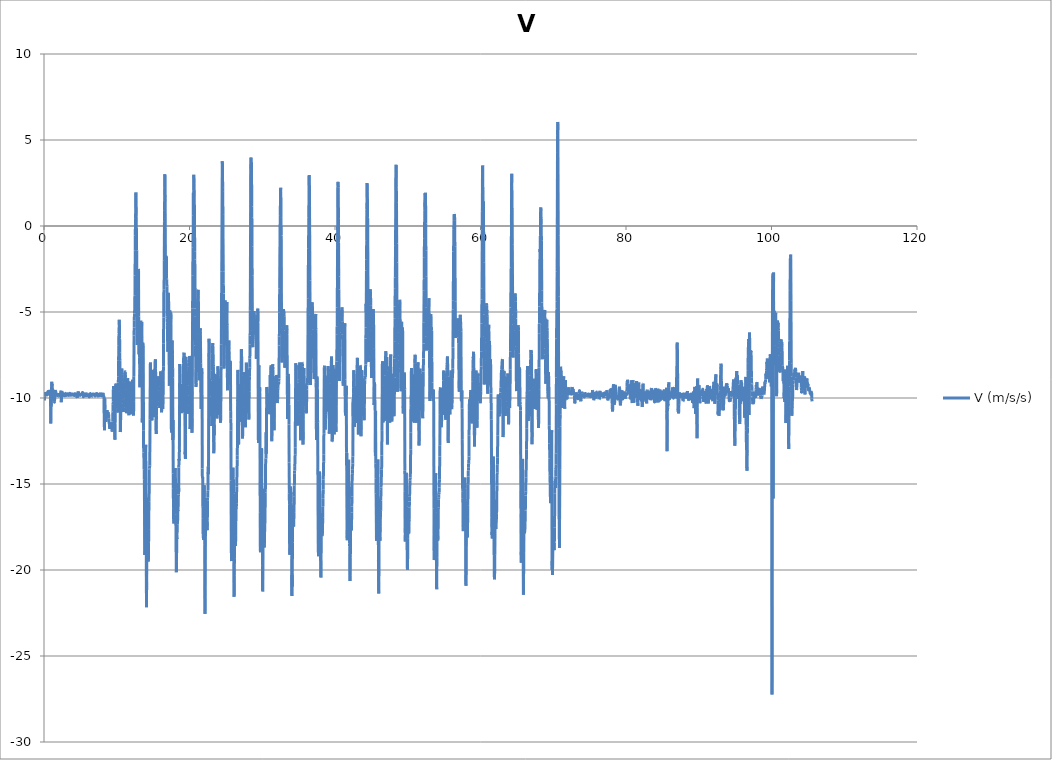
| Category | V (m/s/s) |
|---|---|
| 0.014828 | -9.987 |
| 0.033312 | -10.137 |
| 0.052657 | -9.997 |
| 0.073594 | -9.918 |
| 0.099538 | -9.695 |
| 0.11413 | -9.723 |
| 0.132724 | -9.752 |
| 0.152642 | -9.8 |
| 0.17395 | -9.753 |
| 0.195715 | -9.753 |
| 0.213507 | -9.658 |
| 0.232837 | -9.76 |
| 0.25277 | -9.891 |
| 0.273552 | -9.779 |
| 0.295497 | -9.808 |
| 0.313638 | -9.809 |
| 0.332784 | -9.827 |
| 0.352953 | -9.875 |
| 0.373611 | -9.846 |
| 0.395415 | -9.88 |
| 0.413828 | -9.761 |
| 0.435458 | -9.64 |
| 0.452765 | -9.806 |
| 0.473623 | -9.74 |
| 0.49787 | -9.73 |
| 0.513882 | -9.76 |
| 0.5327 | -9.676 |
| 0.552802 | -9.618 |
| 0.57368 | -9.631 |
| 0.595377 | -9.662 |
| 0.613696 | -9.668 |
| 0.633371 | -9.774 |
| 0.652706 | -9.787 |
| 0.673549 | -9.673 |
| 0.696035 | -9.623 |
| 0.713631 | -9.635 |
| 0.732768 | -9.588 |
| 0.752758 | -9.589 |
| 0.773644 | -9.578 |
| 0.797838 | -9.812 |
| 0.81363 | -9.841 |
| 0.832696 | -9.705 |
| 0.85277 | -9.528 |
| 0.873625 | -9.686 |
| 0.895427 | -9.631 |
| 0.913803 | -10.497 |
| 0.932687 | -11.481 |
| 0.952707 | -9.631 |
| 0.973551 | -10.498 |
| 1.011383 | -10.006 |
| 1.032716 | -9.709 |
| 1.052711 | -9.24 |
| 1.073556 | -9.057 |
| 1.095151 | -9.279 |
| 1.11373 | -9.18 |
| 1.133922 | -9.947 |
| 1.152786 | -9.455 |
| 1.173538 | -9.59 |
| 1.195185 | -9.78 |
| 1.213821 | -9.977 |
| 1.232802 | -10.112 |
| 1.252711 | -9.756 |
| 1.273586 | -9.534 |
| 1.295694 | -9.611 |
| 1.313564 | -9.87 |
| 1.332833 | -9.87 |
| 1.352706 | -9.822 |
| 1.373623 | -9.935 |
| 1.39573 | -10.194 |
| 1.413719 | -10.203 |
| 1.432829 | -10.244 |
| 1.452952 | -10.21 |
| 1.473679 | -9.945 |
| 1.49532 | -9.751 |
| 1.513655 | -9.945 |
| 1.532711 | -9.751 |
| 1.55285 | -9.528 |
| 1.573558 | -9.658 |
| 1.597969 | -9.603 |
| 1.613634 | -9.669 |
| 1.63548 | -9.716 |
| 1.652698 | -9.751 |
| 1.673706 | -9.87 |
| 1.697612 | -9.87 |
| 1.713776 | -9.861 |
| 1.73281 | -9.854 |
| 1.752711 | -9.835 |
| 1.77356 | -9.834 |
| 1.795916 | -9.843 |
| 1.813899 | -9.816 |
| 1.832722 | -9.788 |
| 1.852717 | -9.833 |
| 1.873562 | -9.797 |
| 1.895764 | -9.713 |
| 1.913624 | -9.779 |
| 1.932726 | -9.724 |
| 1.952706 | -9.797 |
| 1.97359 | -9.88 |
| 1.99529 | -9.863 |
| 2.013683 | -9.864 |
| 2.033416 | -9.836 |
| 2.052567 | -9.9 |
| 2.073694 | -9.861 |
| 2.095801 | -9.9 |
| 2.113812 | -9.788 |
| 2.132701 | -9.823 |
| 2.152845 | -9.713 |
| 2.173546 | -9.809 |
| 2.197192 | -9.862 |
| 2.213629 | -9.824 |
| 2.232739 | -9.823 |
| 2.252704 | -9.704 |
| 2.273159 | -9.815 |
| 2.295332 | -9.861 |
| 2.313627 | -9.722 |
| 2.332715 | -9.574 |
| 2.352763 | -9.964 |
| 2.373441 | -10.246 |
| 2.395185 | -10.106 |
| 2.413748 | -9.788 |
| 2.432953 | -9.621 |
| 2.452718 | -9.59 |
| 2.473509 | -9.73 |
| 2.495537 | -9.925 |
| 2.51386 | -9.905 |
| 2.532712 | -9.832 |
| 2.552706 | -9.763 |
| 2.573534 | -9.68 |
| 2.59359 | -9.82 |
| 2.613634 | -9.72 |
| 2.632714 | -9.728 |
| 2.652703 | -9.776 |
| 2.673203 | -9.805 |
| 2.695158 | -9.907 |
| 2.713899 | -9.811 |
| 2.732713 | -9.803 |
| 2.752948 | -9.795 |
| 2.773642 | -9.825 |
| 2.795154 | -9.788 |
| 2.813769 | -9.816 |
| 2.832967 | -9.863 |
| 2.852638 | -9.863 |
| 2.873005 | -9.787 |
| 2.897637 | -9.796 |
| 2.913171 | -9.769 |
| 2.933446 | -9.833 |
| 2.952735 | -9.919 |
| 2.973558 | -9.806 |
| 2.992884 | -9.751 |
| 3.013553 | -9.723 |
| 3.0327 | -9.722 |
| 3.0527 | -9.824 |
| 3.072582 | -9.824 |
| 3.095686 | -9.684 |
| 3.113913 | -9.704 |
| 3.132716 | -9.778 |
| 3.152701 | -9.852 |
| 3.173617 | -9.787 |
| 3.195031 | -9.89 |
| 3.213647 | -9.844 |
| 3.234661 | -9.843 |
| 3.252779 | -9.842 |
| 3.273546 | -9.824 |
| 3.295277 | -9.788 |
| 3.314479 | -9.816 |
| 3.332895 | -9.787 |
| 3.352673 | -9.862 |
| 3.37291 | -9.796 |
| 3.393348 | -9.89 |
| 3.413627 | -9.815 |
| 3.432721 | -9.909 |
| 3.452805 | -9.862 |
| 3.474368 | -9.778 |
| 3.495463 | -9.731 |
| 3.513681 | -9.75 |
| 3.532727 | -9.75 |
| 3.553249 | -9.733 |
| 3.573409 | -9.731 |
| 3.59519 | -9.741 |
| 3.613635 | -9.881 |
| 3.635107 | -9.815 |
| 3.652704 | -9.807 |
| 3.673611 | -9.807 |
| 3.695298 | -9.704 |
| 3.716745 | -9.788 |
| 3.732849 | -9.834 |
| 3.7527 | -9.824 |
| 3.773552 | -9.825 |
| 3.796027 | -9.751 |
| 3.813923 | -9.816 |
| 3.832712 | -9.787 |
| 3.852701 | -9.797 |
| 3.8782 | -9.695 |
| 3.895724 | -9.788 |
| 3.913722 | -9.797 |
| 3.932726 | -9.806 |
| 3.9569 | -9.796 |
| 3.973702 | -9.825 |
| 3.995506 | -9.825 |
| 4.013715 | -9.798 |
| 4.037663 | -9.863 |
| 4.053009 | -9.778 |
| 4.073746 | -9.797 |
| 4.09781 | -9.826 |
| 4.121558 | -9.825 |
| 4.134877 | -9.816 |
| 4.15274 | -9.844 |
| 4.173497 | -9.852 |
| 4.201035 | -9.852 |
| 4.213776 | -9.816 |
| 4.233285 | -9.751 |
| 4.252697 | -9.778 |
| 4.279486 | -9.853 |
| 4.293624 | -9.778 |
| 4.313627 | -9.778 |
| 4.33283 | -9.816 |
| 4.361215 | -9.798 |
| 4.373559 | -9.825 |
| 4.393698 | -9.796 |
| 4.413673 | -9.806 |
| 4.440919 | -9.769 |
| 4.452709 | -9.695 |
| 4.473555 | -9.741 |
| 4.49354 | -9.769 |
| 4.520549 | -9.89 |
| 4.533091 | -9.991 |
| 4.5527 | -10.001 |
| 4.573602 | -9.899 |
| 4.603688 | -9.817 |
| 4.613759 | -9.807 |
| 4.632674 | -9.872 |
| 4.652693 | -9.852 |
| 4.683061 | -9.676 |
| 4.693769 | -9.612 |
| 4.713624 | -9.639 |
| 4.732844 | -9.666 |
| 4.762378 | -9.769 |
| 4.773648 | -9.834 |
| 4.795921 | -9.852 |
| 4.813627 | -9.899 |
| 4.843679 | -9.826 |
| 4.852738 | -9.854 |
| 4.873551 | -9.834 |
| 4.893611 | -9.862 |
| 4.923822 | -9.844 |
| 4.933484 | -9.816 |
| 4.952835 | -9.844 |
| 4.973554 | -9.76 |
| 5.027864 | -9.833 |
| 5.032949 | -9.862 |
| 5.052697 | -9.834 |
| 5.076493 | -9.789 |
| 5.093517 | -9.797 |
| 5.113723 | -9.872 |
| 5.132705 | -9.806 |
| 5.15836 | -9.797 |
| 5.173628 | -9.76 |
| 5.193832 | -9.751 |
| 5.214466 | -9.816 |
| 5.23781 | -9.852 |
| 5.252823 | -9.796 |
| 5.273575 | -9.722 |
| 5.293647 | -9.677 |
| 5.319117 | -9.704 |
| 5.333466 | -9.779 |
| 5.352927 | -9.816 |
| 5.37359 | -9.881 |
| 5.400976 | -9.909 |
| 5.41408 | -9.927 |
| 5.432784 | -9.88 |
| 5.452998 | -9.844 |
| 5.478746 | -9.825 |
| 5.493581 | -9.806 |
| 5.513623 | -9.806 |
| 5.532674 | -9.732 |
| 5.558964 | -9.779 |
| 5.57367 | -9.835 |
| 5.593639 | -9.797 |
| 5.61371 | -9.759 |
| 5.641177 | -9.825 |
| 5.652593 | -9.825 |
| 5.673551 | -9.871 |
| 5.694494 | -9.853 |
| 5.721863 | -9.788 |
| 5.732665 | -9.806 |
| 5.752696 | -9.806 |
| 5.773683 | -9.825 |
| 5.803353 | -9.769 |
| 5.813825 | -9.76 |
| 5.832692 | -9.816 |
| 5.852747 | -9.861 |
| 5.883671 | -9.835 |
| 5.893716 | -9.854 |
| 5.913662 | -9.862 |
| 5.932676 | -9.843 |
| 5.963889 | -9.779 |
| 5.973363 | -9.779 |
| 5.996021 | -9.797 |
| 6.013616 | -9.778 |
| 6.044887 | -9.741 |
| 6.052998 | -9.797 |
| 6.073625 | -9.853 |
| 6.093624 | -9.797 |
| 6.143823 | -9.816 |
| 6.153442 | -9.863 |
| 6.173183 | -9.909 |
| 6.197106 | -9.881 |
| 6.213839 | -9.937 |
| 6.232706 | -9.909 |
| 6.25275 | -9.817 |
| 6.278285 | -9.826 |
| 6.295836 | -9.779 |
| 6.313626 | -9.759 |
| 6.332575 | -9.779 |
| 6.354832 | -9.761 |
| 6.373569 | -9.742 |
| 6.395368 | -9.797 |
| 6.413625 | -9.843 |
| 6.437737 | -9.862 |
| 6.452846 | -9.872 |
| 6.473558 | -9.863 |
| 6.495491 | -9.816 |
| 6.519151 | -9.844 |
| 6.532862 | -9.834 |
| 6.5527 | -9.77 |
| 6.573709 | -9.714 |
| 6.60019 | -9.806 |
| 6.613709 | -9.714 |
| 6.632788 | -9.806 |
| 6.652683 | -9.834 |
| 6.680739 | -9.89 |
| 6.693783 | -9.89 |
| 6.713632 | -9.789 |
| 6.733046 | -9.761 |
| 6.760252 | -9.825 |
| 6.77346 | -9.787 |
| 6.794191 | -9.797 |
| 6.813842 | -9.779 |
| 6.840516 | -9.779 |
| 6.852775 | -9.741 |
| 6.873694 | -9.825 |
| 6.894051 | -9.824 |
| 6.920926 | -9.789 |
| 6.932668 | -9.799 |
| 6.952857 | -9.817 |
| 6.973597 | -9.862 |
| 7.003451 | -9.881 |
| 7.013542 | -9.881 |
| 7.032782 | -9.834 |
| 7.052695 | -9.769 |
| 7.083575 | -9.779 |
| 7.093604 | -9.788 |
| 7.113866 | -9.788 |
| 7.132863 | -9.788 |
| 7.16236 | -9.872 |
| 7.174627 | -9.844 |
| 7.195258 | -9.835 |
| 7.2134 | -9.844 |
| 7.261721 | -9.741 |
| 7.273689 | -9.76 |
| 7.296472 | -9.805 |
| 7.317287 | -9.789 |
| 7.33276 | -9.771 |
| 7.352695 | -9.769 |
| 7.39537 | -9.881 |
| 7.417356 | -9.844 |
| 7.432724 | -9.834 |
| 7.452693 | -9.732 |
| 7.473618 | -9.779 |
| 7.49853 | -9.834 |
| 7.513598 | -9.806 |
| 7.532717 | -9.899 |
| 7.552686 | -9.834 |
| 7.578499 | -9.871 |
| 7.595318 | -9.835 |
| 7.613664 | -9.797 |
| 7.6328 | -9.806 |
| 7.656518 | -9.76 |
| 7.673396 | -9.798 |
| 7.695629 | -9.788 |
| 7.713612 | -9.732 |
| 7.73829 | -9.788 |
| 7.752794 | -9.797 |
| 7.773768 | -9.908 |
| 7.795281 | -9.826 |
| 7.820494 | -9.862 |
| 7.833662 | -9.826 |
| 7.852617 | -9.77 |
| 7.873718 | -9.769 |
| 7.902997 | -9.862 |
| 7.913767 | -9.852 |
| 7.932805 | -9.805 |
| 7.952667 | -9.806 |
| 7.980633 | -9.826 |
| 7.99385 | -9.826 |
| 8.013606 | -9.9 |
| 8.032676 | -9.834 |
| 8.05982 | -9.853 |
| 8.073597 | -9.816 |
| 8.093547 | -9.761 |
| 8.113616 | -9.696 |
| 8.141455 | -9.815 |
| 8.152774 | -9.824 |
| 8.173495 | -9.872 |
| 8.193635 | -9.946 |
| 8.222506 | -9.899 |
| 8.233431 | -9.909 |
| 8.252698 | -10.09 |
| 8.273545 | -11.442 |
| 8.318756 | -11.876 |
| 8.332595 | -10.663 |
| 8.352663 | -10.023 |
| 8.398863 | -11.111 |
| 8.413645 | -11.39 |
| 8.432683 | -11.157 |
| 8.455438 | -11.278 |
| 8.473762 | -11.166 |
| 8.495153 | -11.204 |
| 8.513687 | -11.314 |
| 8.536759 | -11.378 |
| 8.552891 | -10.961 |
| 8.573729 | -10.756 |
| 8.597349 | -10.811 |
| 8.619157 | -10.922 |
| 8.632839 | -10.96 |
| 8.652949 | -10.859 |
| 8.673544 | -10.7 |
| 8.699311 | -10.86 |
| 8.713729 | -11.093 |
| 8.73289 | -11.139 |
| 8.75271 | -11.089 |
| 8.778669 | -11.071 |
| 8.793901 | -10.886 |
| 8.813537 | -10.831 |
| 8.833106 | -10.821 |
| 8.857674 | -10.97 |
| 8.873639 | -11.028 |
| 8.893636 | -10.962 |
| 8.913713 | -11.173 |
| 8.93702 | -11.398 |
| 8.952752 | -11.472 |
| 8.97354 | -11.492 |
| 8.993517 | -11.408 |
| 9.01793 | -11.724 |
| 9.032851 | -11.733 |
| 9.052731 | -11.789 |
| 9.073555 | -11.665 |
| 9.100426 | -11.77 |
| 9.113888 | -11.697 |
| 9.132713 | -11.622 |
| 9.152702 | -11.779 |
| 9.180458 | -11.613 |
| 9.193732 | -11.566 |
| 9.213089 | -11.575 |
| 9.232697 | -11.481 |
| 9.260629 | -11.546 |
| 9.273715 | -11.583 |
| 9.293548 | -11.534 |
| 9.314246 | -11.508 |
| 9.339323 | -11.594 |
| 9.352772 | -11.882 |
| 9.372751 | -11.958 |
| 9.393624 | -11.881 |
| 9.435717 | -11.38 |
| 9.45278 | -10.868 |
| 9.473606 | -10.783 |
| 9.493265 | -10.369 |
| 9.513724 | -10.21 |
| 9.532824 | -9.523 |
| 9.552763 | -9.318 |
| 9.574627 | -9.405 |
| 9.594539 | -9.324 |
| 9.613646 | -9.517 |
| 9.633096 | -9.778 |
| 9.653078 | -10.179 |
| 9.673518 | -10.337 |
| 9.695676 | -11.027 |
| 9.713606 | -11.707 |
| 9.73472 | -12.312 |
| 9.752715 | -12.422 |
| 9.773619 | -11.573 |
| 9.795842 | -10.663 |
| 9.837608 | -9.33 |
| 9.853419 | -9.31 |
| 9.873781 | -9.23 |
| 9.896361 | -9.162 |
| 9.914085 | -9.385 |
| 9.932683 | -9.722 |
| 9.953022 | -9.627 |
| 9.975173 | -9.342 |
| 9.995654 | -9.284 |
| 10.013657 | -9.285 |
| 10.032859 | -9.373 |
| 10.054368 | -9.805 |
| 10.073628 | -10.103 |
| 10.096251 | -10.597 |
| 10.113635 | -10.616 |
| 10.134923 | -10.717 |
| 10.152769 | -10.808 |
| 10.173533 | -10.845 |
| 10.195907 | -9.864 |
| 10.218262 | -9.098 |
| 10.232726 | -8.745 |
| 10.252671 | -7.832 |
| 10.273527 | -6.95 |
| 10.298055 | -6.249 |
| 10.313885 | -6.221 |
| 10.332789 | -5.762 |
| 10.352758 | -5.453 |
| 10.379172 | -6.362 |
| 10.394326 | -6.547 |
| 10.413616 | -7.358 |
| 10.43269 | -7.81 |
| 10.458676 | -9.641 |
| 10.473619 | -10.653 |
| 10.493594 | -11.981 |
| 10.514413 | -11.801 |
| 10.555072 | -10.702 |
| 10.57377 | -10.62 |
| 10.593314 | -10.321 |
| 10.614391 | -9.735 |
| 10.632733 | -9.096 |
| 10.652692 | -8.622 |
| 10.673534 | -8.382 |
| 10.695392 | -8.288 |
| 10.713612 | -8.332 |
| 10.732838 | -8.5 |
| 10.752684 | -8.632 |
| 10.774995 | -9.057 |
| 10.795344 | -9.401 |
| 10.813541 | -9.764 |
| 10.832681 | -10.101 |
| 10.853299 | -10.315 |
| 10.872973 | -10.697 |
| 10.895849 | -10.818 |
| 10.914061 | -10.66 |
| 10.934105 | -10.791 |
| 10.952703 | -10.773 |
| 10.973539 | -10.557 |
| 10.995627 | -10.407 |
| 11.01641 | -10.025 |
| 11.032852 | -9.477 |
| 11.052686 | -9.113 |
| 11.073517 | -9.009 |
| 11.096878 | -8.666 |
| 11.113819 | -8.546 |
| 11.132699 | -8.502 |
| 11.152694 | -8.474 |
| 11.175125 | -8.49 |
| 11.195305 | -8.64 |
| 11.213898 | -8.798 |
| 11.232691 | -9.18 |
| 11.256385 | -9.506 |
| 11.273595 | -9.739 |
| 11.295469 | -10.122 |
| 11.313744 | -10.393 |
| 11.335207 | -10.643 |
| 11.352672 | -10.882 |
| 11.373135 | -10.731 |
| 11.395636 | -10.546 |
| 11.418736 | -9.867 |
| 11.433005 | -9.745 |
| 11.452721 | -9.236 |
| 11.473132 | -8.984 |
| 11.500461 | -8.854 |
| 11.514669 | -8.845 |
| 11.532682 | -9.006 |
| 11.552682 | -9.499 |
| 11.59823 | -10.597 |
| 11.613716 | -10.773 |
| 11.632756 | -10.634 |
| 11.652681 | -10.94 |
| 11.67418 | -11.002 |
| 11.695469 | -10.737 |
| 11.713599 | -10.469 |
| 11.734356 | -9.877 |
| 11.752706 | -9.309 |
| 11.773511 | -9.168 |
| 11.795101 | -9.05 |
| 11.816208 | -9.043 |
| 11.832705 | -9.192 |
| 11.852678 | -9.536 |
| 11.873544 | -9.731 |
| 11.896934 | -10.093 |
| 11.913704 | -10.138 |
| 11.932678 | -10.241 |
| 11.952674 | -10.093 |
| 11.97626 | -10.188 |
| 11.995336 | -10.523 |
| 12.013696 | -10.234 |
| 12.032896 | -10.95 |
| 12.055807 | -10.866 |
| 12.073243 | -10.818 |
| 12.095863 | -10.221 |
| 12.113654 | -9.933 |
| 12.135814 | -9.392 |
| 12.152677 | -9.224 |
| 12.173578 | -8.937 |
| 12.195492 | -9.091 |
| 12.219323 | -9.35 |
| 12.232952 | -9.711 |
| 12.252841 | -10.344 |
| 12.273494 | -10.486 |
| 12.29941 | -10.956 |
| 12.314494 | -11.021 |
| 12.333733 | -10.188 |
| 12.352672 | -8.741 |
| 12.380025 | -6.363 |
| 12.393924 | -5.899 |
| 12.413656 | -5.484 |
| 12.432694 | -5.081 |
| 12.473068 | -4.824 |
| 12.493551 | -4.029 |
| 12.514271 | -2.88 |
| 12.539683 | -1.413 |
| 12.552688 | -0.571 |
| 12.573527 | 0.452 |
| 12.593612 | 0.642 |
| 12.621493 | 1.854 |
| 12.63262 | 1.951 |
| 12.652686 | 1.643 |
| 12.673525 | 0.568 |
| 12.720545 | -0.755 |
| 12.732748 | -1.423 |
| 12.75268 | -2.784 |
| 12.775058 | -4.512 |
| 12.793824 | -6.071 |
| 12.813754 | -6.919 |
| 12.832695 | -6.305 |
| 12.857241 | -4.943 |
| 12.873567 | -4.39 |
| 12.89345 | -4.778 |
| 12.913601 | -5.125 |
| 12.936777 | -4.28 |
| 12.95279 | -3.53 |
| 12.973539 | -2.495 |
| 12.994139 | -2.604 |
| 13.01735 | -5.257 |
| 13.032798 | -6.338 |
| 13.052673 | -7.463 |
| 13.073803 | -5.784 |
| 13.098264 | -5.699 |
| 13.114645 | -6.658 |
| 13.132696 | -7.631 |
| 13.1533 | -8.291 |
| 13.178261 | -9.377 |
| 13.195669 | -9.19 |
| 13.213688 | -8.653 |
| 13.23289 | -8.743 |
| 13.258829 | -6.365 |
| 13.273594 | -5.676 |
| 13.296078 | -5.503 |
| 13.313777 | -5.812 |
| 13.338401 | -6.169 |
| 13.352765 | -6.392 |
| 13.373695 | -6.474 |
| 13.395609 | -6.166 |
| 13.42148 | -5.787 |
| 13.432757 | -5.576 |
| 13.452737 | -5.796 |
| 13.473586 | -7.804 |
| 13.50238 | -11.394 |
| 13.514927 | -11.419 |
| 13.532763 | -10.878 |
| 13.552907 | -9.748 |
| 13.584099 | -6.781 |
| 13.593617 | -6.873 |
| 13.613603 | -6.871 |
| 13.632797 | -7.036 |
| 13.663279 | -10.24 |
| 13.67375 | -11.87 |
| 13.69529 | -12.958 |
| 13.713603 | -13.168 |
| 13.765434 | -14.175 |
| 13.795748 | -14.731 |
| 13.841789 | -18.54 |
| 13.852719 | -19.134 |
| 13.873532 | -18.818 |
| 13.92138 | -15.401 |
| 13.932844 | -14.527 |
| 13.952672 | -13.302 |
| 13.97523 | -12.717 |
| 13.9936 | -13.097 |
| 14.012795 | -14.17 |
| 14.032924 | -16.147 |
| 14.057765 | -18.289 |
| 14.073549 | -21.346 |
| 14.093549 | -22.162 |
| 14.113744 | -20.701 |
| 14.158705 | -17.09 |
| 14.172775 | -16.641 |
| 14.194343 | -15.912 |
| 14.217451 | -15.845 |
| 14.232973 | -16.01 |
| 14.252711 | -15.791 |
| 14.272705 | -16.32 |
| 14.299948 | -17.925 |
| 14.313763 | -18.614 |
| 14.332665 | -19.504 |
| 14.352668 | -19.304 |
| 14.381411 | -18.387 |
| 14.393711 | -17.628 |
| 14.413668 | -16.624 |
| 14.432693 | -16.026 |
| 14.459612 | -15.346 |
| 14.473648 | -14.163 |
| 14.493973 | -14.089 |
| 14.5136 | -14.022 |
| 14.539397 | -13.92 |
| 14.552657 | -13.137 |
| 14.573528 | -11.268 |
| 14.593606 | -9.359 |
| 14.619052 | -8.04 |
| 14.632761 | -7.935 |
| 14.653017 | -8.584 |
| 14.673608 | -9.901 |
| 14.7022 | -11.019 |
| 14.713967 | -11.161 |
| 14.732757 | -11.125 |
| 14.752638 | -11.032 |
| 14.781401 | -11.129 |
| 14.794018 | -11.294 |
| 14.813599 | -11.129 |
| 14.832688 | -11.294 |
| 14.86159 | -11.071 |
| 14.873605 | -10.928 |
| 14.895977 | -10.125 |
| 14.913751 | -9.758 |
| 14.95883 | -8.413 |
| 14.973844 | -8.357 |
| 14.99357 | -8.387 |
| 15.016368 | -8.951 |
| 15.032626 | -9.117 |
| 15.052673 | -9.467 |
| 15.073537 | -10.056 |
| 15.098073 | -10.705 |
| 15.113845 | -10.996 |
| 15.132658 | -11.112 |
| 15.152703 | -10.591 |
| 15.176944 | -9.772 |
| 15.193789 | -9.217 |
| 15.213613 | -8.782 |
| 15.232683 | -8.417 |
| 15.258574 | -8.035 |
| 15.273632 | -7.867 |
| 15.293654 | -7.797 |
| 15.313666 | -7.753 |
| 15.338429 | -8.308 |
| 15.352682 | -8.766 |
| 15.373576 | -10.053 |
| 15.393658 | -11.293 |
| 15.418882 | -12.09 |
| 15.43282 | -11.826 |
| 15.452759 | -11.025 |
| 15.473407 | -10.497 |
| 15.500457 | -9.142 |
| 15.513618 | -9.015 |
| 15.532714 | -9.142 |
| 15.55283 | -9.015 |
| 15.582075 | -8.826 |
| 15.593785 | -8.74 |
| 15.613599 | -8.946 |
| 15.632802 | -8.9 |
| 15.661732 | -9.426 |
| 15.673633 | -9.546 |
| 15.693834 | -9.708 |
| 15.714407 | -9.872 |
| 15.740166 | -9.844 |
| 15.753549 | -9.824 |
| 15.773575 | -9.648 |
| 15.793566 | -9.758 |
| 15.820673 | -9.945 |
| 15.832844 | -9.953 |
| 15.852777 | -10.205 |
| 15.873495 | -10.472 |
| 15.902914 | -10.579 |
| 15.914614 | -10.392 |
| 15.93268 | -9.811 |
| 15.952704 | -9.316 |
| 15.999026 | -8.68 |
| 16.013569 | -8.483 |
| 16.032667 | -8.445 |
| 16.05563 | -8.457 |
| 16.073733 | -8.477 |
| 16.09592 | -9.636 |
| 16.113846 | -9.963 |
| 16.135181 | -10.551 |
| 16.152686 | -10.835 |
| 16.173488 | -10.756 |
| 16.195561 | -10.4 |
| 16.21764 | -9.731 |
| 16.232896 | -9.47 |
| 16.252672 | -8.947 |
| 16.293083 | -9.363 |
| 16.317909 | -10.639 |
| 16.333572 | -10.545 |
| 16.352719 | -10.019 |
| 16.373594 | -9.862 |
| 16.39911 | -9.001 |
| 16.413957 | -8.152 |
| 16.43274 | -6.848 |
| 16.452773 | -5.321 |
| 16.478701 | -3.841 |
| 16.49327 | -3.675 |
| 16.513269 | -3.133 |
| 16.532563 | -2.022 |
| 16.558431 | 0.248 |
| 16.57368 | 0.883 |
| 16.593597 | 2.232 |
| 16.613697 | 3.013 |
| 16.638711 | 2.202 |
| 16.652602 | 1.687 |
| 16.67359 | -0.081 |
| 16.69342 | -3.097 |
| 16.720833 | -3.018 |
| 16.733414 | -2.764 |
| 16.752716 | -2.029 |
| 16.773566 | -1.725 |
| 16.804083 | -2.177 |
| 16.813731 | -1.939 |
| 16.83268 | -1.793 |
| 16.852708 | -3.057 |
| 16.882097 | -3.13 |
| 16.893586 | -3.529 |
| 16.913599 | -5.265 |
| 16.932923 | -5.376 |
| 16.962811 | -5.594 |
| 16.972862 | -5.795 |
| 16.995661 | -6.788 |
| 17.013686 | -7.308 |
| 17.044228 | -7.096 |
| 17.052709 | -6.284 |
| 17.073553 | -4.941 |
| 17.093601 | -3.883 |
| 17.13883 | -4.492 |
| 17.155306 | -5.511 |
| 17.173897 | -6.093 |
| 17.197754 | -7.981 |
| 17.214446 | -8.67 |
| 17.232614 | -9.291 |
| 17.252931 | -9.197 |
| 17.277324 | -5.69 |
| 17.295755 | -4.906 |
| 17.313619 | -4.987 |
| 17.33284 | -5.734 |
| 17.355169 | -6.335 |
| 17.373589 | -6.268 |
| 17.397062 | -5.616 |
| 17.413977 | -5.24 |
| 17.437259 | -5.034 |
| 17.452705 | -5.65 |
| 17.474445 | -9.061 |
| 17.495544 | -11.572 |
| 17.519034 | -12.004 |
| 17.533738 | -11.494 |
| 17.552682 | -9.929 |
| 17.57377 | -7.851 |
| 17.60049 | -7.221 |
| 17.613526 | -6.714 |
| 17.632744 | -6.655 |
| 17.652799 | -7.484 |
| 17.681785 | -8.264 |
| 17.693107 | -8.805 |
| 17.713598 | -12.439 |
| 17.73282 | -11.282 |
| 17.761962 | -14.397 |
| 17.77341 | -15.24 |
| 17.794113 | -16.419 |
| 17.813611 | -17.067 |
| 17.840479 | -17.297 |
| 17.852608 | -17.241 |
| 17.873528 | -16.762 |
| 17.895738 | -15.546 |
| 17.922121 | -15.297 |
| 17.932771 | -15.483 |
| 17.952667 | -15.346 |
| 17.973563 | -15.099 |
| 18.004573 | -14.687 |
| 18.013702 | -14.317 |
| 18.032773 | -14.075 |
| 18.052728 | -14.479 |
| 18.084542 | -15.285 |
| 18.093556 | -15.988 |
| 18.113729 | -16.795 |
| 18.132682 | -17.642 |
| 18.165234 | -19.078 |
| 18.17349 | -19.632 |
| 18.195382 | -20.132 |
| 18.213777 | -19.509 |
| 18.259771 | -18.122 |
| 18.274112 | -18.2 |
| 18.295673 | -17.913 |
| 18.317239 | -17.37 |
| 18.333397 | -17.325 |
| 18.352824 | -17.083 |
| 18.373449 | -17.125 |
| 18.396237 | -16.518 |
| 18.413696 | -16.584 |
| 18.432893 | -16.392 |
| 18.452601 | -16.044 |
| 18.476294 | -15.616 |
| 18.495065 | -14.955 |
| 18.513619 | -15.456 |
| 18.532685 | -14.042 |
| 18.55659 | -13.546 |
| 18.573514 | -13.629 |
| 18.596278 | -13.586 |
| 18.613609 | -12.972 |
| 18.637286 | -9.425 |
| 18.652672 | -8.631 |
| 18.673449 | -8.021 |
| 18.698185 | -8.861 |
| 18.721836 | -9.778 |
| 18.733119 | -9.866 |
| 18.752741 | -10.299 |
| 18.77356 | -10.328 |
| 18.801077 | -10.393 |
| 18.81445 | -10.525 |
| 18.832594 | -10.789 |
| 18.852667 | -10.311 |
| 18.881936 | -10.73 |
| 18.894059 | -10.88 |
| 18.913738 | -10.771 |
| 18.932581 | -10.565 |
| 18.959219 | -10.221 |
| 18.973579 | -9.978 |
| 18.99374 | -9.19 |
| 19.013758 | -9.244 |
| 19.040991 | -9.827 |
| 19.052631 | -10.034 |
| 19.073512 | -10.542 |
| 19.092886 | -10.827 |
| 19.123118 | -10.182 |
| 19.132823 | -9.725 |
| 19.152667 | -8.865 |
| 19.173635 | -7.982 |
| 19.202384 | -7.51 |
| 19.213666 | -7.475 |
| 19.232675 | -7.393 |
| 19.253292 | -7.366 |
| 19.298084 | -7.548 |
| 19.313591 | -7.814 |
| 19.332699 | -8.491 |
| 19.35527 | -9.876 |
| 19.373229 | -11.633 |
| 19.394503 | -13.276 |
| 19.413796 | -13.126 |
| 19.435561 | -13.551 |
| 19.45267 | -12.142 |
| 19.473533 | -10.437 |
| 19.494125 | -7.668 |
| 19.51579 | -7.607 |
| 19.533598 | -7.903 |
| 19.552684 | -8.36 |
| 19.57353 | -8.531 |
| 19.597591 | -9.004 |
| 19.613751 | -9.766 |
| 19.632681 | -10.174 |
| 19.652701 | -10.382 |
| 19.678963 | -10.556 |
| 19.693485 | -10.559 |
| 19.713596 | -10.625 |
| 19.732671 | -10.738 |
| 19.758977 | -10.796 |
| 19.77277 | -10.915 |
| 19.793685 | -10.809 |
| 19.814752 | -10.436 |
| 19.838724 | -9.856 |
| 19.85261 | -9.268 |
| 19.87382 | -8.547 |
| 19.893559 | -8.164 |
| 19.921202 | -7.963 |
| 19.93289 | -7.924 |
| 19.953149 | -7.786 |
| 19.973767 | -7.897 |
| 20.002227 | -7.684 |
| 20.013738 | -7.563 |
| 20.032687 | -7.572 |
| 20.052695 | -7.863 |
| 20.080763 | -11.799 |
| 20.093643 | -11.57 |
| 20.113592 | -10.673 |
| 20.132764 | -10.255 |
| 20.161487 | -9.174 |
| 20.173597 | -8.662 |
| 20.19368 | -8.41 |
| 20.213685 | -8.342 |
| 20.241625 | -8.969 |
| 20.252608 | -10.156 |
| 20.273595 | -11.347 |
| 20.294166 | -9.633 |
| 20.323039 | -11.441 |
| 20.33285 | -11.897 |
| 20.352663 | -12.024 |
| 20.373579 | -11.138 |
| 20.423315 | -4.777 |
| 20.432811 | -4.189 |
| 20.452793 | -2.897 |
| 20.475831 | -1.272 |
| 20.493505 | -0.879 |
| 20.513645 | 0.602 |
| 20.532644 | 1.937 |
| 20.555675 | 1.121 |
| 20.573528 | 2.056 |
| 20.593634 | 2.978 |
| 20.613949 | 2.47 |
| 20.636449 | 2.082 |
| 20.652728 | 1.974 |
| 20.673589 | 1.108 |
| 20.693171 | 0.029 |
| 20.718726 | -1.473 |
| 20.732654 | -1.946 |
| 20.752748 | -2.79 |
| 20.773504 | -3.603 |
| 20.799579 | -4.797 |
| 20.813736 | -5.254 |
| 20.83264 | -6.969 |
| 20.852662 | -8.268 |
| 20.880316 | -9.306 |
| 20.893679 | -9.359 |
| 20.913595 | -9.221 |
| 20.932707 | -9.104 |
| 20.959911 | -7.783 |
| 20.973803 | -7.209 |
| 20.994201 | -6.387 |
| 21.013529 | -6.306 |
| 21.038602 | -6.197 |
| 21.05267 | -5.826 |
| 21.073548 | -5.309 |
| 21.095621 | -4.769 |
| 21.12146 | -4.382 |
| 21.132857 | -4.509 |
| 21.152664 | -4.19 |
| 21.173187 | -3.729 |
| 21.202096 | -3.708 |
| 21.21379 | -4.057 |
| 21.232654 | -5.061 |
| 21.252697 | -6.248 |
| 21.282298 | -7.174 |
| 21.293688 | -7.643 |
| 21.313048 | -8.476 |
| 21.332674 | -8.965 |
| 21.363912 | -8.733 |
| 21.37353 | -8.084 |
| 21.392826 | -7.028 |
| 21.413668 | -6.432 |
| 21.443072 | -5.973 |
| 21.452691 | -6.05 |
| 21.473518 | -5.945 |
| 21.493707 | -6.118 |
| 21.540451 | -7.977 |
| 21.552827 | -8.83 |
| 21.573613 | -10.381 |
| 21.599407 | -10.636 |
| 21.613932 | -10.311 |
| 21.633475 | -9.5 |
| 21.65284 | -8.95 |
| 21.677048 | -8.367 |
| 21.695961 | -8.269 |
| 21.713647 | -8.913 |
| 21.732598 | -9.817 |
| 21.755952 | -14.103 |
| 21.773528 | -14.664 |
| 21.794723 | -14.652 |
| 21.813692 | -14.601 |
| 21.838368 | -16.329 |
| 21.852535 | -16.994 |
| 21.87388 | -17.921 |
| 21.895267 | -18.009 |
| 21.91948 | -18.254 |
| 21.93264 | -18.145 |
| 21.952667 | -18.116 |
| 21.973482 | -17.617 |
| 22.000625 | -16.331 |
| 22.013004 | -15.581 |
| 22.032618 | -15.067 |
| 22.052587 | -16.212 |
| 22.080552 | -17.555 |
| 22.094854 | -18.525 |
| 22.113541 | -21.665 |
| 22.132602 | -22.551 |
| 22.185519 | -18.025 |
| 22.193777 | -17.181 |
| 22.213719 | -16.048 |
| 22.240403 | -15.913 |
| 22.252642 | -16.316 |
| 22.273522 | -16.958 |
| 22.293435 | -17.239 |
| 22.32182 | -16.97 |
| 22.33261 | -16.852 |
| 22.352656 | -17.001 |
| 22.373523 | -17.496 |
| 22.405656 | -17.24 |
| 22.413352 | -17.499 |
| 22.43268 | -17.685 |
| 22.452721 | -17.123 |
| 22.484109 | -15.943 |
| 22.493515 | -15.777 |
| 22.513517 | -15.518 |
| 22.532755 | -15.368 |
| 22.563965 | -14.168 |
| 22.57367 | -13.988 |
| 22.595027 | -14.427 |
| 22.613593 | -13.991 |
| 22.65888 | -7.636 |
| 22.674259 | -6.936 |
| 22.69436 | -6.554 |
| 22.716365 | -7.71 |
| 22.732844 | -8.899 |
| 22.752652 | -9.912 |
| 22.773288 | -10.561 |
| 22.799963 | -11.039 |
| 22.813669 | -11.064 |
| 22.83333 | -10.93 |
| 22.852664 | -10.963 |
| 22.879698 | -10.929 |
| 22.893716 | -10.808 |
| 22.913592 | -10.485 |
| 22.933163 | -10.115 |
| 22.958883 | -10.04 |
| 22.973786 | -10.147 |
| 22.993813 | -10.344 |
| 23.013589 | -10.693 |
| 23.040541 | -11.01 |
| 23.052606 | -11.337 |
| 23.073403 | -11.626 |
| 23.093657 | -11.06 |
| 23.120638 | -8.996 |
| 23.132905 | -8.391 |
| 23.152724 | -7.415 |
| 23.173428 | -6.938 |
| 23.202519 | -6.806 |
| 23.213949 | -6.994 |
| 23.232821 | -7.277 |
| 23.252643 | -7.532 |
| 23.283478 | -8.067 |
| 23.29358 | -8.185 |
| 23.313585 | -12.437 |
| 23.332655 | -13.21 |
| 23.362587 | -13.026 |
| 23.373507 | -11.55 |
| 23.395405 | -12.162 |
| 23.413383 | -11.4 |
| 23.443708 | -9.3 |
| 23.452661 | -8.839 |
| 23.473097 | -8.602 |
| 23.493717 | -8.638 |
| 23.523046 | -8.775 |
| 23.532657 | -8.841 |
| 23.552827 | -8.991 |
| 23.573522 | -8.972 |
| 23.607307 | -8.76 |
| 23.632662 | -8.786 |
| 23.652709 | -9.157 |
| 23.70491 | -10.605 |
| 23.733233 | -10.827 |
| 23.757545 | -11.19 |
| 23.773919 | -11.177 |
| 23.796195 | -10.505 |
| 23.813714 | -10.225 |
| 23.835981 | -9.309 |
| 23.852645 | -9.029 |
| 23.873526 | -8.46 |
| 23.895978 | -8.155 |
| 23.918645 | -8.216 |
| 23.933457 | -8.322 |
| 23.952661 | -8.427 |
| 23.973553 | -8.818 |
| 24.000339 | -9.715 |
| 24.013603 | -10.098 |
| 24.032717 | -10.732 |
| 24.052652 | -10.985 |
| 24.080311 | -10.802 |
| 24.09357 | -10.557 |
| 24.113511 | -10.051 |
| 24.132664 | -9.655 |
| 24.159949 | -9.364 |
| 24.173995 | -9.437 |
| 24.193635 | -9.499 |
| 24.213597 | -9.84 |
| 24.240488 | -11.167 |
| 24.252821 | -11.398 |
| 24.272899 | -11.442 |
| 24.293464 | -10.953 |
| 24.320349 | -9.905 |
| 24.332602 | -8.959 |
| 24.352652 | -8.157 |
| 24.373516 | -6.899 |
| 24.402697 | -4.888 |
| 24.413655 | -4.134 |
| 24.432814 | -2.652 |
| 24.452653 | -0.818 |
| 24.483415 | 1.98 |
| 24.49368 | 2.868 |
| 24.513552 | 3.766 |
| 24.532629 | 3.367 |
| 24.562803 | 2.232 |
| 24.573695 | 1.996 |
| 24.595217 | 0.68 |
| 24.613639 | -0.757 |
| 24.64271 | -2.64 |
| 24.652669 | -3.363 |
| 24.673499 | -3.918 |
| 24.693986 | -4.953 |
| 24.723432 | -7.398 |
| 24.733647 | -7.805 |
| 24.752734 | -8.279 |
| 24.77376 | -7.757 |
| 24.819679 | -5.792 |
| 24.832681 | -5.393 |
| 24.852568 | -4.898 |
| 24.875413 | -4.519 |
| 24.893543 | -4.324 |
| 24.91358 | -4.382 |
| 24.933132 | -5.092 |
| 24.957597 | -5.918 |
| 24.973551 | -6.622 |
| 24.99372 | -6.917 |
| 25.013577 | -6.897 |
| 25.038699 | -6.515 |
| 25.05262 | -5.952 |
| 25.07367 | -5.431 |
| 25.093616 | -5.127 |
| 25.117906 | -4.838 |
| 25.132679 | -4.459 |
| 25.152699 | -4.413 |
| 25.173517 | -5.782 |
| 25.200391 | -8.52 |
| 25.213859 | -9.205 |
| 25.232752 | -9.556 |
| 25.252646 | -8.599 |
| 25.281026 | -7.192 |
| 25.294222 | -7.455 |
| 25.313714 | -7.324 |
| 25.332694 | -8.037 |
| 25.359794 | -7.582 |
| 25.373538 | -7.269 |
| 25.393686 | -6.902 |
| 25.413668 | -6.659 |
| 25.441611 | -7.03 |
| 25.452621 | -7.548 |
| 25.473576 | -8.537 |
| 25.493675 | -8.644 |
| 25.52092 | -8.649 |
| 25.532782 | -8.825 |
| 25.552655 | -8.959 |
| 25.573573 | -8.995 |
| 25.603742 | -7.872 |
| 25.613695 | -7.836 |
| 25.632573 | -8.183 |
| 25.652646 | -10.763 |
| 25.684016 | -11.175 |
| 25.693735 | -11.909 |
| 25.713507 | -14.8 |
| 25.732663 | -17.734 |
| 25.764528 | -19.435 |
| 25.773788 | -19.48 |
| 25.79358 | -19.046 |
| 25.813248 | -18.096 |
| 25.842193 | -17.026 |
| 25.852597 | -16.505 |
| 25.873151 | -15.668 |
| 25.893785 | -15.288 |
| 25.940745 | -15.551 |
| 25.952977 | -15.18 |
| 25.973914 | -14.048 |
| 25.999589 | -14.809 |
| 26.013946 | -15.324 |
| 26.032654 | -14.752 |
| 26.052815 | -15.574 |
| 26.076647 | -17.67 |
| 26.093619 | -18.878 |
| 26.113583 | -20.767 |
| 26.133015 | -21.554 |
| 26.157968 | -20.324 |
| 26.173578 | -19.351 |
| 26.193542 | -17.619 |
| 26.213992 | -16.326 |
| 26.237313 | -15.888 |
| 26.252931 | -15.973 |
| 26.273523 | -16.709 |
| 26.293705 | -17.477 |
| 26.318385 | -18.574 |
| 26.332654 | -18.599 |
| 26.352695 | -17.973 |
| 26.373516 | -17.194 |
| 26.400961 | -16.448 |
| 26.414 | -16.467 |
| 26.432669 | -16.457 |
| 26.452663 | -16.143 |
| 26.48042 | -15.409 |
| 26.494515 | -15.127 |
| 26.512678 | -14.588 |
| 26.532827 | -14.307 |
| 26.562823 | -13.559 |
| 26.573585 | -13.354 |
| 26.595196 | -12.15 |
| 26.613736 | -10.22 |
| 26.641646 | -8.564 |
| 26.652619 | -8.365 |
| 26.673523 | -8.541 |
| 26.695365 | -9.957 |
| 26.722425 | -12.206 |
| 26.732728 | -12.609 |
| 26.752656 | -12.705 |
| 26.773481 | -11.762 |
| 26.804205 | -10.67 |
| 26.813526 | -10.518 |
| 26.83265 | -10.232 |
| 26.852646 | -10.026 |
| 26.883784 | -9.485 |
| 26.893691 | -9.392 |
| 26.913581 | -9.294 |
| 26.932658 | -9.203 |
| 26.963609 | -9.595 |
| 26.973585 | -9.912 |
| 26.996021 | -10.951 |
| 27.013589 | -11.384 |
| 27.058654 | -10.689 |
| 27.073643 | -10.068 |
| 27.093773 | -7.962 |
| 27.115751 | -7.333 |
| 27.132831 | -7.149 |
| 27.152658 | -7.404 |
| 27.173489 | -7.696 |
| 27.198439 | -8.465 |
| 27.213829 | -8.705 |
| 27.232857 | -9.453 |
| 27.252651 | -10.668 |
| 27.279167 | -12.236 |
| 27.29355 | -12.356 |
| 27.313578 | -12.052 |
| 27.332643 | -11.096 |
| 27.357901 | -9.753 |
| 27.373446 | -9.562 |
| 27.39369 | -9.363 |
| 27.413582 | -9.346 |
| 27.43914 | -9.342 |
| 27.452671 | -9.23 |
| 27.473495 | -9.007 |
| 27.493563 | -8.8 |
| 27.518865 | -8.553 |
| 27.532809 | -8.497 |
| 27.552643 | -8.554 |
| 27.572614 | -8.771 |
| 27.602255 | -9.408 |
| 27.614575 | -9.644 |
| 27.632649 | -10.535 |
| 27.652643 | -11.125 |
| 27.682622 | -11.705 |
| 27.693674 | -11.345 |
| 27.713574 | -10.646 |
| 27.732848 | -10.487 |
| 27.76206 | -9.543 |
| 27.773597 | -9.08 |
| 27.79324 | -8.416 |
| 27.812618 | -7.944 |
| 27.84083 | -8 |
| 27.852679 | -8.216 |
| 27.873487 | -8.594 |
| 27.898203 | -10.554 |
| 27.924667 | -10.822 |
| 27.933588 | -10.859 |
| 27.952649 | -10.585 |
| 27.973521 | -9.985 |
| 28.004402 | -9.039 |
| 28.014208 | -8.817 |
| 28.032795 | -8.58 |
| 28.052748 | -8.798 |
| 28.100507 | -10.235 |
| 28.113743 | -10.514 |
| 28.13287 | -11.045 |
| 28.155577 | -11.252 |
| 28.173543 | -11.167 |
| 28.19512 | -10.033 |
| 28.213654 | -9.622 |
| 28.235792 | -8.737 |
| 28.252694 | -8.494 |
| 28.273552 | -8.234 |
| 28.295299 | -7.697 |
| 28.318427 | -6.901 |
| 28.332706 | -6.359 |
| 28.352764 | -4.924 |
| 28.373642 | -2.913 |
| 28.399214 | 0.925 |
| 28.413819 | 2.847 |
| 28.432652 | 3.484 |
| 28.45271 | 3.976 |
| 28.479153 | 3.072 |
| 28.493627 | 1.955 |
| 28.513584 | 3.691 |
| 28.532751 | 2.828 |
| 28.561482 | 1.136 |
| 28.573438 | 0.483 |
| 28.593447 | -1.202 |
| 28.613617 | -2.885 |
| 28.640243 | -5.285 |
| 28.65267 | -6.062 |
| 28.673604 | -7.02 |
| 28.693828 | -7.045 |
| 28.719979 | -6.696 |
| 28.733032 | -6.566 |
| 28.752646 | -6.237 |
| 28.793489 | -6.205 |
| 28.820688 | -5.825 |
| 28.832939 | -5.743 |
| 28.852584 | -5.277 |
| 28.873624 | -4.941 |
| 28.902919 | -5.364 |
| 28.91399 | -5.566 |
| 28.932656 | -5.967 |
| 28.952606 | -6.036 |
| 28.981869 | -6.232 |
| 28.993652 | -6.29 |
| 29.012681 | -5.948 |
| 29.032641 | -5.565 |
| 29.062784 | -5.416 |
| 29.073575 | -5.66 |
| 29.095568 | -5.993 |
| 29.113573 | -6.466 |
| 29.142106 | -6.73 |
| 29.152572 | -6.978 |
| 29.173521 | -7.181 |
| 29.193715 | -7.724 |
| 29.24023 | -5.821 |
| 29.252567 | -5.5 |
| 29.273509 | -5.184 |
| 29.298526 | -5.702 |
| 29.314364 | -6.614 |
| 29.332643 | -6.823 |
| 29.35279 | -6.046 |
| 29.380652 | -4.807 |
| 29.394355 | -4.802 |
| 29.41349 | -5.618 |
| 29.4326 | -8.657 |
| 29.455772 | -12.061 |
| 29.473353 | -12.613 |
| 29.495038 | -11.185 |
| 29.513583 | -9.203 |
| 29.538718 | -8.103 |
| 29.552676 | -8.537 |
| 29.573756 | -9.961 |
| 29.594682 | -10.964 |
| 29.618938 | -10.288 |
| 29.633106 | -9.714 |
| 29.65293 | -9.381 |
| 29.673501 | -9.706 |
| 29.70364 | -14.888 |
| 29.713829 | -16.653 |
| 29.732626 | -18.843 |
| 29.752625 | -18.971 |
| 29.782991 | -18.696 |
| 29.793529 | -18.541 |
| 29.813576 | -17.852 |
| 29.832653 | -16.988 |
| 29.863146 | -15.461 |
| 29.873565 | -14.632 |
| 29.89521 | -13.121 |
| 29.913624 | -12.915 |
| 29.941516 | -14.64 |
| 29.952807 | -15.348 |
| 29.973484 | -16.702 |
| 29.997971 | -17.247 |
| 30.025332 | -18.717 |
| 30.032736 | -19.736 |
| 30.052635 | -21.243 |
| 30.073511 | -21.197 |
| 30.105021 | -19.012 |
| 30.113791 | -18.073 |
| 30.132646 | -16.275 |
| 30.153102 | -15.276 |
| 30.185264 | -16.204 |
| 30.193607 | -16.875 |
| 30.213576 | -18.326 |
| 30.232702 | -16.317 |
| 30.265095 | -18.44 |
| 30.27348 | -18.689 |
| 30.29565 | -18.447 |
| 30.31366 | -17.967 |
| 30.361789 | -17.281 |
| 30.37381 | -17.032 |
| 30.394786 | -16.39 |
| 30.421927 | -15.485 |
| 30.432769 | -15.232 |
| 30.452557 | -14.017 |
| 30.473574 | -13.664 |
| 30.500581 | -13.514 |
| 30.514128 | -13.012 |
| 30.532913 | -11.995 |
| 30.552635 | -13.236 |
| 30.579217 | -12.499 |
| 30.594186 | -11.053 |
| 30.612855 | -9.882 |
| 30.632706 | -9.358 |
| 30.664255 | -9.464 |
| 30.673521 | -9.808 |
| 30.693335 | -10.148 |
| 30.713633 | -10.485 |
| 30.741056 | -10.63 |
| 30.752659 | -10.486 |
| 30.773461 | -10.552 |
| 30.793601 | -10.399 |
| 30.818972 | -9.995 |
| 30.833099 | -9.845 |
| 30.852786 | -9.735 |
| 30.873442 | -9.877 |
| 30.90307 | -9.908 |
| 30.914193 | -9.86 |
| 30.932755 | -9.782 |
| 30.952624 | -9.901 |
| 30.98466 | -10.706 |
| 30.994305 | -10.942 |
| 31.013634 | -10.865 |
| 31.032645 | -10.174 |
| 31.06384 | -8.747 |
| 31.095374 | -8.669 |
| 31.113575 | -8.791 |
| 31.142353 | -8.733 |
| 31.152782 | -8.703 |
| 31.173532 | -8.416 |
| 31.193614 | -8.097 |
| 31.221428 | -8.103 |
| 31.232687 | -8.26 |
| 31.25273 | -9.409 |
| 31.27305 | -10.048 |
| 31.304912 | -12.448 |
| 31.313732 | -12.511 |
| 31.332665 | -11.927 |
| 31.352908 | -10.841 |
| 31.402875 | -8.415 |
| 31.414124 | -8.22 |
| 31.432668 | -8.04 |
| 31.456225 | -8.152 |
| 31.473534 | -8.352 |
| 31.494347 | -8.742 |
| 31.513573 | -8.768 |
| 31.536898 | -8.732 |
| 31.552675 | -8.835 |
| 31.572943 | -9.362 |
| 31.595346 | -10.437 |
| 31.620608 | -11.499 |
| 31.632859 | -11.879 |
| 31.652635 | -11.286 |
| 31.67342 | -9.52 |
| 31.699453 | -9.215 |
| 31.714116 | -9.104 |
| 31.7327 | -8.919 |
| 31.753477 | -9.189 |
| 31.779776 | -9.728 |
| 31.793913 | -10.297 |
| 31.81355 | -10.219 |
| 31.832719 | -10.208 |
| 31.861151 | -10.279 |
| 31.873541 | -9.911 |
| 31.893521 | -9.441 |
| 31.914825 | -9.199 |
| 31.942135 | -8.827 |
| 31.952586 | -8.66 |
| 31.973298 | -8.672 |
| 31.993591 | -9.124 |
| 32.022643 | -9.85 |
| 32.032596 | -9.97 |
| 32.052559 | -10.173 |
| 32.07355 | -10.292 |
| 32.103844 | -10.208 |
| 32.113785 | -10.086 |
| 32.132672 | -9.759 |
| 32.15264 | -9.462 |
| 32.185512 | -9.236 |
| 32.213169 | -9.143 |
| 32.232653 | -9.181 |
| 32.262975 | -9.189 |
| 32.273666 | -9.045 |
| 32.295846 | -8.873 |
| 32.313905 | -7.852 |
| 32.343551 | -6.944 |
| 32.352663 | -6.411 |
| 32.373502 | -5.045 |
| 32.393701 | -3.623 |
| 32.42416 | -1.225 |
| 32.452733 | -0.053 |
| 32.473511 | 0.62 |
| 32.523812 | 2.147 |
| 32.532695 | 2.224 |
| 32.55259 | 1.996 |
| 32.590213 | 0.48 |
| 32.594183 | 0.006 |
| 32.615162 | -0.56 |
| 32.632627 | -3.894 |
| 32.665334 | -5.9 |
| 32.673013 | -6.433 |
| 32.695663 | -7.839 |
| 32.713505 | -7.934 |
| 32.736559 | -7.757 |
| 32.752662 | -7.516 |
| 32.773642 | -6.901 |
| 32.794964 | -6.236 |
| 32.820422 | -5.387 |
| 32.833816 | -5.209 |
| 32.85265 | -5.063 |
| 32.873047 | -5.099 |
| 32.901668 | -4.991 |
| 32.91353 | -4.884 |
| 32.932729 | -4.828 |
| 32.952691 | -5.053 |
| 32.980671 | -5.002 |
| 32.993628 | -5.033 |
| 33.013599 | -5.275 |
| 33.032666 | -6.056 |
| 33.061138 | -7.198 |
| 33.07371 | -7.661 |
| 33.093627 | -8.242 |
| 33.114471 | -8.205 |
| 33.142247 | -7.131 |
| 33.152803 | -6.671 |
| 33.173423 | -6.273 |
| 33.19358 | -6.412 |
| 33.221205 | -6.75 |
| 33.232807 | -6.83 |
| 33.25275 | -7.014 |
| 33.273418 | -7.083 |
| 33.302006 | -6.761 |
| 33.314024 | -6.487 |
| 33.332635 | -6.29 |
| 33.373323 | -5.767 |
| 33.403879 | -6.317 |
| 33.413662 | -6.983 |
| 33.432627 | -8.672 |
| 33.45263 | -9.785 |
| 33.483346 | -11.227 |
| 33.493654 | -11.043 |
| 33.513749 | -10.207 |
| 33.532776 | -9.495 |
| 33.566865 | -8.82 |
| 33.573263 | -8.598 |
| 33.59489 | -8.716 |
| 33.613564 | -8.738 |
| 33.660859 | -10.386 |
| 33.673578 | -11.539 |
| 33.696084 | -13.747 |
| 33.720648 | -15.532 |
| 33.732967 | -16.176 |
| 33.752643 | -17.795 |
| 33.77339 | -19.118 |
| 33.804204 | -18.631 |
| 33.813769 | -18.249 |
| 33.832624 | -17.118 |
| 33.852544 | -16.13 |
| 33.878249 | -15.285 |
| 33.895446 | -15.143 |
| 33.913563 | -15.405 |
| 33.932574 | -15.579 |
| 33.956857 | -15.471 |
| 33.973485 | -15.504 |
| 33.995324 | -16.068 |
| 34.013504 | -18.436 |
| 34.039061 | -19.138 |
| 34.052541 | -20.467 |
| 34.073123 | -21.509 |
| 34.096043 | -20.291 |
| 34.122778 | -20.961 |
| 34.132798 | -20.141 |
| 34.15269 | -18.412 |
| 34.173312 | -17.21 |
| 34.202809 | -16.247 |
| 34.213498 | -16.528 |
| 34.232648 | -16.977 |
| 34.252675 | -17.459 |
| 34.283979 | -17.472 |
| 34.294594 | -17.359 |
| 34.313486 | -17.466 |
| 34.332723 | -17.349 |
| 34.363796 | -16.664 |
| 34.373647 | -16.451 |
| 34.395591 | -15.749 |
| 34.413572 | -15.094 |
| 34.443057 | -14.37 |
| 34.452642 | -14.213 |
| 34.473664 | -14.004 |
| 34.493542 | -13.717 |
| 34.522844 | -13.303 |
| 34.532658 | -12.893 |
| 34.552689 | -11.457 |
| 34.573504 | -10.175 |
| 34.60721 | -8.443 |
| 34.613391 | -7.979 |
| 34.632802 | -8.205 |
| 34.65263 | -11.089 |
| 34.702234 | -10.853 |
| 34.713596 | -10.585 |
| 34.732662 | -10.644 |
| 34.755354 | -11.16 |
| 34.773494 | -11.521 |
| 34.795194 | -11.587 |
| 34.813691 | -11.52 |
| 34.836933 | -11.597 |
| 34.852571 | -11.338 |
| 34.873428 | -10.753 |
| 34.895195 | -10.137 |
| 34.919548 | -10.008 |
| 34.933736 | -10.086 |
| 34.952635 | -10.134 |
| 34.973502 | -9.944 |
| 35.001606 | -9.104 |
| 35.013488 | -8.908 |
| 35.032606 | -8.097 |
| 35.052629 | -8.159 |
| 35.080106 | -8.39 |
| 35.093883 | -8.229 |
| 35.113662 | -8.313 |
| 35.132755 | -8.039 |
| 35.162948 | -7.936 |
| 35.173585 | -8.114 |
| 35.19559 | -8.906 |
| 35.213573 | -9.296 |
| 35.241522 | -10.979 |
| 35.252786 | -11.597 |
| 35.273497 | -12.452 |
| 35.297415 | -12.098 |
| 35.325364 | -10.638 |
| 35.334644 | -10.441 |
| 35.352633 | -10.153 |
| 35.373772 | -9.37 |
| 35.403566 | -8.315 |
| 35.414766 | -8.178 |
| 35.432743 | -8.042 |
| 35.452635 | -7.931 |
| 35.48338 | -7.951 |
| 35.514011 | -8.021 |
| 35.532963 | -8.164 |
| 35.564189 | -10.693 |
| 35.573535 | -11.428 |
| 35.595218 | -12.525 |
| 35.613561 | -12.708 |
| 35.642889 | -11.242 |
| 35.652629 | -10.512 |
| 35.673478 | -9.24 |
| 35.693836 | -8.387 |
| 35.727502 | -8.254 |
| 35.732679 | -8.292 |
| 35.752564 | -8.62 |
| 35.773501 | -9.08 |
| 35.823031 | -10.135 |
| 35.832867 | -10.27 |
| 35.852722 | -9.741 |
| 35.877379 | -9.581 |
| 35.893762 | -9.245 |
| 35.913491 | -9.234 |
| 35.93251 | -9.605 |
| 35.955943 | -10.102 |
| 35.973489 | -10.658 |
| 35.99356 | -10.805 |
| 36.01363 | -10.733 |
| 36.038326 | -10.884 |
| 36.052636 | -10.892 |
| 36.073482 | -10.81 |
| 36.093788 | -10.463 |
| 36.119064 | -9.509 |
| 36.132897 | -9.273 |
| 36.152667 | -9.155 |
| 36.173514 | -9.232 |
| 36.201088 | -9.092 |
| 36.213492 | -8.832 |
| 36.232734 | -9.126 |
| 36.252625 | -8.365 |
| 36.280405 | -6.336 |
| 36.293812 | -5.759 |
| 36.313559 | -4.201 |
| 36.332634 | -2.673 |
| 36.361086 | -1.293 |
| 36.373913 | -0.635 |
| 36.393719 | 0.492 |
| 36.414087 | 1.413 |
| 36.441862 | 2.922 |
| 36.452905 | 2.959 |
| 36.473467 | 2.59 |
| 36.493616 | 1.627 |
| 36.520881 | -0.521 |
| 36.53264 | -1.399 |
| 36.552633 | -3.172 |
| 36.57348 | -5.142 |
| 36.603419 | -8.304 |
| 36.613822 | -8.987 |
| 36.632655 | -9.245 |
| 36.652623 | -8.403 |
| 36.684111 | -6.739 |
| 36.693651 | -6.312 |
| 36.713563 | -5.744 |
| 36.732634 | -5.775 |
| 36.764135 | -5.2 |
| 36.773542 | -5.09 |
| 36.795335 | -5.673 |
| 36.813649 | -5.313 |
| 36.844526 | -4.505 |
| 36.873483 | -4.436 |
| 36.893534 | -4.672 |
| 36.939312 | -5.299 |
| 36.953148 | -5.485 |
| 36.974449 | -6.005 |
| 37.00015 | -6.22 |
| 37.013674 | -6.863 |
| 37.032824 | -7.683 |
| 37.052618 | -6.863 |
| 37.079698 | -8.074 |
| 37.093713 | -8.491 |
| 37.113689 | -8.899 |
| 37.132686 | -8.883 |
| 37.159245 | -7.776 |
| 37.173125 | -7.412 |
| 37.193637 | -6.596 |
| 37.213557 | -5.599 |
| 37.240187 | -5.439 |
| 37.252618 | -5.543 |
| 37.273442 | -5.667 |
| 37.293532 | -5.574 |
| 37.319878 | -5.353 |
| 37.332704 | -5.207 |
| 37.352695 | -5.111 |
| 37.373616 | -6.002 |
| 37.402857 | -9.1 |
| 37.41384 | -10.2 |
| 37.432623 | -11.445 |
| 37.452691 | -12.44 |
| 37.482861 | -11.469 |
| 37.493472 | -10.477 |
| 37.513551 | -9.113 |
| 37.532794 | -8.754 |
| 37.563618 | -9 |
| 37.573549 | -9.377 |
| 37.596243 | -10.045 |
| 37.613553 | -11.423 |
| 37.6424 | -14.13 |
| 37.652632 | -15.005 |
| 37.673496 | -16.571 |
| 37.693555 | -18.465 |
| 37.723991 | -19.195 |
| 37.733507 | -18.709 |
| 37.752607 | -17.67 |
| 37.773472 | -16.987 |
| 37.805779 | -16.023 |
| 37.813541 | -15.872 |
| 37.832493 | -15.478 |
| 37.852713 | -14.958 |
| 37.885133 | -14.279 |
| 37.893532 | -14.514 |
| 37.913559 | -14.9 |
| 37.932646 | -16.158 |
| 37.963273 | -17.291 |
| 37.973524 | -17.326 |
| 37.995325 | -18.001 |
| 38.013599 | -19.157 |
| 38.060314 | -20.434 |
| 38.073685 | -19.809 |
| 38.095232 | -18.951 |
| 38.120219 | -17.355 |
| 38.132873 | -17.007 |
| 38.152634 | -16.682 |
| 38.173317 | -16.872 |
| 38.201406 | -17.735 |
| 38.213679 | -17.998 |
| 38.232637 | -18.02 |
| 38.252649 | -18.002 |
| 38.280904 | -17.679 |
| 38.293648 | -17.435 |
| 38.313557 | -16.927 |
| 38.332793 | -16.318 |
| 38.361292 | -15.863 |
| 38.373662 | -15.313 |
| 38.39355 | -14.718 |
| 38.413771 | -14.299 |
| 38.439715 | -13.701 |
| 38.45267 | -13.273 |
| 38.473583 | -12.046 |
| 38.493607 | -10.517 |
| 38.521505 | -8.631 |
| 38.53299 | -8.227 |
| 38.553364 | -8.176 |
| 38.573632 | -8.121 |
| 38.603258 | -9.738 |
| 38.613777 | -10.46 |
| 38.632607 | -10.823 |
| 38.652946 | -11.837 |
| 38.683048 | -11.553 |
| 38.693641 | -11.388 |
| 38.713637 | -11.201 |
| 38.732703 | -11.062 |
| 38.763795 | -10.942 |
| 38.796545 | -9.537 |
| 38.813852 | -9.277 |
| 38.845126 | -8.714 |
| 38.852657 | -8.717 |
| 38.873631 | -8.897 |
| 38.893562 | -8.718 |
| 38.923844 | -9.564 |
| 38.932665 | -10.089 |
| 38.952597 | -10.791 |
| 38.973486 | -10.678 |
| 39.005979 | -9.495 |
| 39.014123 | -8.973 |
| 39.032617 | -8.21 |
| 39.052618 | -8.147 |
| 39.099902 | -8.487 |
| 39.113489 | -8.361 |
| 39.132744 | -8.396 |
| 39.1564 | -8.529 |
| 39.173729 | -9.138 |
| 39.195311 | -10.522 |
| 39.213362 | -12.073 |
| 39.235739 | -11.932 |
| 39.252556 | -11.394 |
| 39.273481 | -10.569 |
| 39.298026 | -10.109 |
| 39.321224 | -9.897 |
| 39.332817 | -9.785 |
| 39.352611 | -9.488 |
| 39.373532 | -9.163 |
| 39.400752 | -8.894 |
| 39.413589 | -8.808 |
| 39.432594 | -8.631 |
| 39.452612 | -8.547 |
| 39.481213 | -8.142 |
| 39.493545 | -8.013 |
| 39.513662 | -7.589 |
| 39.532682 | -7.722 |
| 39.560575 | -9.896 |
| 39.573534 | -10.914 |
| 39.594031 | -12.533 |
| 39.614527 | -12.525 |
| 39.640052 | -12.41 |
| 39.652618 | -11.883 |
| 39.673584 | -10.549 |
| 39.6941 | -9.25 |
| 39.723011 | -8.096 |
| 39.732754 | -8.079 |
| 39.753217 | -8.374 |
| 39.773472 | -8.801 |
| 39.803383 | -9.405 |
| 39.813829 | -9.619 |
| 39.832631 | -10.228 |
| 39.85271 | -10.96 |
| 39.883524 | -12.115 |
| 39.893627 | -12.048 |
| 39.913887 | -11.239 |
| 39.932621 | -9.993 |
| 39.963195 | -8.611 |
| 39.973661 | -8.336 |
| 39.996164 | -8.354 |
| 40.013547 | -8.457 |
| 40.043147 | -8.704 |
| 40.052618 | -8.864 |
| 40.073452 | -9.43 |
| 40.093862 | -10.426 |
| 40.123975 | -11.825 |
| 40.133438 | -11.971 |
| 40.152614 | -11.628 |
| 40.173491 | -10.48 |
| 40.22124 | -7.968 |
| 40.232613 | -7.874 |
| 40.252665 | -7.442 |
| 40.27725 | -6.289 |
| 40.293465 | -5.826 |
| 40.31354 | -4.735 |
| 40.332625 | -3.146 |
| 40.358312 | -0.228 |
| 40.373514 | 0.76 |
| 40.393724 | 2.236 |
| 40.41362 | 2.566 |
| 40.439576 | 2.234 |
| 40.452538 | 1.9 |
| 40.473538 | 0.456 |
| 40.493673 | -0.978 |
| 40.518972 | -2.941 |
| 40.532636 | -3.692 |
| 40.55262 | -5.656 |
| 40.573313 | -7.631 |
| 40.601763 | -9.014 |
| 40.613672 | -8.882 |
| 40.632662 | -8.099 |
| 40.652616 | -7.125 |
| 40.68076 | -6.195 |
| 40.693652 | -5.795 |
| 40.712773 | -5.147 |
| 40.732906 | -4.907 |
| 40.759162 | -4.942 |
| 40.773542 | -5.037 |
| 40.795423 | -4.941 |
| 40.813799 | -5.037 |
| 40.839924 | -5.032 |
| 40.85261 | -5.011 |
| 40.873508 | -5.13 |
| 40.895199 | -5.358 |
| 40.922568 | -5.198 |
| 40.932656 | -5.059 |
| 40.952612 | -4.731 |
| 40.973466 | -4.778 |
| 41.003209 | -5.233 |
| 41.013796 | -5.54 |
| 41.032705 | -6.299 |
| 41.07342 | -7.042 |
| 41.105179 | -8.77 |
| 41.113501 | -9.13 |
| 41.132631 | -9.285 |
| 41.152613 | -9.038 |
| 41.183793 | -8.169 |
| 41.193533 | -7.842 |
| 41.213554 | -6.98 |
| 41.232611 | -6.478 |
| 41.264227 | -6.297 |
| 41.273714 | -6.168 |
| 41.295308 | -5.998 |
| 41.313658 | -5.892 |
| 41.35772 | -5.649 |
| 41.372844 | -8.936 |
| 41.393448 | -9.957 |
| 41.417095 | -10.625 |
| 41.432835 | -11.016 |
| 41.452612 | -10.387 |
| 41.47345 | -9.527 |
| 41.499128 | -9.326 |
| 41.513863 | -9.345 |
| 41.532703 | -9.831 |
| 41.552894 | -9.292 |
| 41.579276 | -13.184 |
| 41.594185 | -13.904 |
| 41.613578 | -13.19 |
| 41.632691 | -16.1 |
| 41.658941 | -17.983 |
| 41.673505 | -18.265 |
| 41.693636 | -17.901 |
| 41.713543 | -17.311 |
| 41.740329 | -17.457 |
| 41.752553 | -17.379 |
| 41.773525 | -17.145 |
| 41.793401 | -16.484 |
| 41.819633 | -15.348 |
| 41.832672 | -14.785 |
| 41.852664 | -14.051 |
| 41.873498 | -13.592 |
| 41.902157 | -14.598 |
| 41.913734 | -15.317 |
| 41.933369 | -15.867 |
| 41.952723 | -15.167 |
| 41.983504 | -17.814 |
| 41.994139 | -18.454 |
| 42.013758 | -18.622 |
| 42.03262 | -19.596 |
| 42.06308 | -20.64 |
| 42.073713 | -20.341 |
| 42.094165 | -19.258 |
| 42.113605 | -19.085 |
| 42.143391 | -17.672 |
| 42.173467 | -17.291 |
| 42.193661 | -17.395 |
| 42.222814 | -17.417 |
| 42.234181 | -17.539 |
| 42.252615 | -17.699 |
| 42.273774 | -17.343 |
| 42.303816 | -16.664 |
| 42.314267 | -16.31 |
| 42.332619 | -15.745 |
| 42.352635 | -14.821 |
| 42.395327 | -14.406 |
| 42.413426 | -14.169 |
| 42.432628 | -13.815 |
| 42.454007 | -13.4 |
| 42.473481 | -11.071 |
| 42.495217 | -10.061 |
| 42.513771 | -11.071 |
| 42.535718 | -9.729 |
| 42.552843 | -9.394 |
| 42.573527 | -8.389 |
| 42.595688 | -8.9 |
| 42.619062 | -9.666 |
| 42.632854 | -10.322 |
| 42.652601 | -11.106 |
| 42.673877 | -11.679 |
| 42.699921 | -11.441 |
| 42.714005 | -11.117 |
| 42.732724 | -10.458 |
| 42.752646 | -10.25 |
| 42.779072 | -10.099 |
| 42.793151 | -9.968 |
| 42.813828 | -9.673 |
| 42.832775 | -9.328 |
| 42.858932 | -9.665 |
| 42.87349 | -10.284 |
| 42.893566 | -10.803 |
| 42.915226 | -11.454 |
| 42.94044 | -10.901 |
| 42.952773 | -10.311 |
| 42.973712 | -9.39 |
| 42.993808 | -8.783 |
| 43.022424 | -8.42 |
| 43.032626 | -8.291 |
| 43.052685 | -7.822 |
| 43.073462 | -7.664 |
| 43.102713 | -7.895 |
| 43.113676 | -8.175 |
| 43.132706 | -8.659 |
| 43.152686 | -9.536 |
| 43.182508 | -11.302 |
| 43.19351 | -11.784 |
| 43.213546 | -12.123 |
| 43.23281 | -11.659 |
| 43.262715 | -10.349 |
| 43.273702 | -9.913 |
| 43.295182 | -9.472 |
| 43.313544 | -9.013 |
| 43.343539 | -8.527 |
| 43.352589 | -8.435 |
| 43.373491 | -8.44 |
| 43.413465 | -8.425 |
| 43.44304 | -8.11 |
| 43.452617 | -8.12 |
| 43.473467 | -8.129 |
| 43.494215 | -8.205 |
| 43.538191 | -9.893 |
| 43.552873 | -11.485 |
| 43.573492 | -12.224 |
| 43.597291 | -11.72 |
| 43.613918 | -10.688 |
| 43.632698 | -9.847 |
| 43.65258 | -8.987 |
| 43.679513 | -8.372 |
| 43.695279 | -8.435 |
| 43.713613 | -8.907 |
| 43.733162 | -11.03 |
| 43.75775 | -11.046 |
| 43.773508 | -10.505 |
| 43.793843 | -9.951 |
| 43.813462 | -9.847 |
| 43.836708 | -8.968 |
| 43.852719 | -8.866 |
| 43.873441 | -8.883 |
| 43.897757 | -9.242 |
| 43.92184 | -9.652 |
| 43.934687 | -9.877 |
| 43.952579 | -10.628 |
| 43.97353 | -10.59 |
| 44.001063 | -11.292 |
| 44.014344 | -11.166 |
| 44.032601 | -10.561 |
| 44.052578 | -9.822 |
| 44.078995 | -8.995 |
| 44.094129 | -8.941 |
| 44.113601 | -8.902 |
| 44.13262 | -8.73 |
| 44.162688 | -8.779 |
| 44.173567 | -8.714 |
| 44.195704 | -8.6 |
| 44.213543 | -8.056 |
| 44.241647 | -6.536 |
| 44.252688 | -5.894 |
| 44.273463 | -4.517 |
| 44.296275 | -4.992 |
| 44.323808 | -2.593 |
| 44.332837 | -1.949 |
| 44.352611 | -0.854 |
| 44.373616 | 0.967 |
| 44.406008 | 2.462 |
| 44.413354 | 2.495 |
| 44.432623 | 2.012 |
| 44.452584 | 1.616 |
| 44.483556 | 0.511 |
| 44.493555 | 0.042 |
| 44.513049 | -1.223 |
| 44.532926 | -4.481 |
| 44.561868 | -6.683 |
| 44.572927 | -7.268 |
| 44.595174 | -7.884 |
| 44.613638 | -7.904 |
| 44.662168 | -7.65 |
| 44.673792 | -7.585 |
| 44.695146 | -6.548 |
| 44.720195 | -5.681 |
| 44.732665 | -5.635 |
| 44.752603 | -5.411 |
| 44.773543 | -4.825 |
| 44.799154 | -4.862 |
| 44.813686 | -4.629 |
| 44.83268 | -3.682 |
| 44.852603 | -4.088 |
| 44.879876 | -3.852 |
| 44.893587 | -4.088 |
| 44.913698 | -4.621 |
| 44.932618 | -5.18 |
| 44.960537 | -6.079 |
| 44.973646 | -6.608 |
| 44.993538 | -7.861 |
| 45.013543 | -8.835 |
| 45.03849 | -8.641 |
| 45.052566 | -8.253 |
| 45.073468 | -7.538 |
| 45.093252 | -7.166 |
| 45.12249 | -6.792 |
| 45.133226 | -6.637 |
| 45.152615 | -6.149 |
| 45.173172 | -5.857 |
| 45.201319 | -5.794 |
| 45.214225 | -5.786 |
| 45.23298 | -5.335 |
| 45.25263 | -4.832 |
| 45.282668 | -5.089 |
| 45.294122 | -5.24 |
| 45.313714 | -5.88 |
| 45.332623 | -7.1 |
| 45.36322 | -9.627 |
| 45.373549 | -10.404 |
| 45.395429 | -9.953 |
| 45.413616 | -9.328 |
| 45.444914 | -9.101 |
| 45.452756 | -9.41 |
| 45.473443 | -10.079 |
| 45.493445 | -10.223 |
| 45.524729 | -10.922 |
| 45.532656 | -11.794 |
| 45.552605 | -13.371 |
| 45.573456 | -10.772 |
| 45.606595 | -13.273 |
| 45.613184 | -13.79 |
| 45.632778 | -14.698 |
| 45.652929 | -15.569 |
| 45.702846 | -18.296 |
| 45.713789 | -18.136 |
| 45.733545 | -17.011 |
| 45.759961 | -16.681 |
| 45.773478 | -16.774 |
| 45.795603 | -16.544 |
| 45.81358 | -16.271 |
| 45.839226 | -15.764 |
| 45.852561 | -14.795 |
| 45.872979 | -13.745 |
| 45.895282 | -13.571 |
| 45.921028 | -15.28 |
| 45.932683 | -16.1 |
| 45.952713 | -17.728 |
| 45.973479 | -19.417 |
| 46.003049 | -21.249 |
| 46.013718 | -21.371 |
| 46.032614 | -20.28 |
| 46.052609 | -18.882 |
| 46.084047 | -17.236 |
| 46.094601 | -16.566 |
| 46.113595 | -15.88 |
| 46.132702 | -16.086 |
| 46.163407 | -17.842 |
| 46.173579 | -18.294 |
| 46.195469 | -18.064 |
| 46.213363 | -17.475 |
| 46.239796 | -16.965 |
| 46.252636 | -16.929 |
| 46.27348 | -16.548 |
| 46.295188 | -15.956 |
| 46.323822 | -15.342 |
| 46.333555 | -15.204 |
| 46.353175 | -14.915 |
| 46.373418 | -14.619 |
| 46.40542 | -14.142 |
| 46.413598 | -13.956 |
| 46.432604 | -13.344 |
| 46.452645 | -11.911 |
| 46.485183 | -9.719 |
| 46.493647 | -9.069 |
| 46.513542 | -7.997 |
| 46.532593 | -7.863 |
| 46.564168 | -9.27 |
| 46.573554 | -9.7 |
| 46.59534 | -10.729 |
| 46.613585 | -11.427 |
| 46.646015 | -10.664 |
| 46.652635 | -10.501 |
| 46.673586 | -10.293 |
| 46.693444 | -10.492 |
| 46.724625 | -10.425 |
| 46.732727 | -10.321 |
| 46.752676 | -9.882 |
| 46.773385 | -9.532 |
| 46.821139 | -9.799 |
| 46.832582 | -10.091 |
| 46.852627 | -9.547 |
| 46.8787 | -11.328 |
| 46.893461 | -10.913 |
| 46.913536 | -9.807 |
| 46.932734 | -8.679 |
| 46.957765 | -7.547 |
| 46.973521 | -7.278 |
| 46.994661 | -7.352 |
| 47.013627 | -7.589 |
| 47.038455 | -7.78 |
| 47.052612 | -7.752 |
| 47.073821 | -7.672 |
| 47.093653 | -7.796 |
| 47.118214 | -7.624 |
| 47.132556 | -7.756 |
| 47.152931 | -8.392 |
| 47.173443 | -10.014 |
| 47.201177 | -12.697 |
| 47.213648 | -12.252 |
| 47.232709 | -11.03 |
| 47.252614 | -9.941 |
| 47.281158 | -9.524 |
| 47.293512 | -9.346 |
| 47.313899 | -9.166 |
| 47.332597 | -9.225 |
| 47.359099 | -9.208 |
| 47.373508 | -9.211 |
| 47.395216 | -9.15 |
| 47.414282 | -8.77 |
| 47.442558 | -8.208 |
| 47.452629 | -8.174 |
| 47.473301 | -8.664 |
| 47.495406 | -9.294 |
| 47.524175 | -11.371 |
| 47.533069 | -11.433 |
| 47.552596 | -11.055 |
| 47.573447 | -10.231 |
| 47.604378 | -8.961 |
| 47.613584 | -8.588 |
| 47.632628 | -7.816 |
| 47.652598 | -7.464 |
| 47.683755 | -8.288 |
| 47.693289 | -8.701 |
| 47.713678 | -9.655 |
| 47.732614 | -10.241 |
| 47.764489 | -10.694 |
| 47.7735 | -10.889 |
| 47.793493 | -11.224 |
| 47.813459 | -11.372 |
| 47.842314 | -10.922 |
| 47.852888 | -10.745 |
| 47.873512 | -9.512 |
| 47.893053 | -9.511 |
| 47.946107 | -8.588 |
| 47.952555 | -8.731 |
| 47.973596 | -9.049 |
| 48.000534 | -9.362 |
| 48.013545 | -9.475 |
| 48.032616 | -9.803 |
| 48.052616 | -9.559 |
| 48.078723 | -10.44 |
| 48.093565 | -10.947 |
| 48.113799 | -11.059 |
| 48.132783 | -10.945 |
| 48.159994 | -9.944 |
| 48.17353 | -8.802 |
| 48.193595 | -7.721 |
| 48.213742 | -6.694 |
| 48.241904 | -5.394 |
| 48.252617 | -4.687 |
| 48.273499 | -3.655 |
| 48.294706 | -2.993 |
| 48.32152 | -1.112 |
| 48.33286 | -0.239 |
| 48.352691 | 2.048 |
| 48.373556 | 3.058 |
| 48.4015 | 3.555 |
| 48.413868 | 3.268 |
| 48.432575 | 2.22 |
| 48.452618 | 1.351 |
| 48.482355 | -1.017 |
| 48.493152 | -2.123 |
| 48.513538 | -5.004 |
| 48.532606 | -7.987 |
| 48.564565 | -9.641 |
| 48.573505 | -9.591 |
| 48.595596 | -8.881 |
| 48.613532 | -8.139 |
| 48.643501 | -7.813 |
| 48.652587 | -7.547 |
| 48.673554 | -6.828 |
| 48.693438 | -6.21 |
| 48.724346 | -5.683 |
| 48.73267 | -5.778 |
| 48.752579 | -5.387 |
| 48.773466 | -5.277 |
| 48.807496 | -5.195 |
| 48.832749 | -5.057 |
| 48.852527 | -4.892 |
| 48.885338 | -4.48 |
| 48.893477 | -4.293 |
| 48.91359 | -4.342 |
| 48.932624 | -4.796 |
| 48.965219 | -5.816 |
| 48.973327 | -6.224 |
| 48.995508 | -7.262 |
| 49.013 | -8.304 |
| 49.062595 | -9.61 |
| 49.073201 | -9.178 |
| 49.096068 | -8.327 |
| 49.129209 | -6.229 |
| 49.152546 | -5.563 |
| 49.173459 | -5.562 |
| 49.200631 | -6.096 |
| 49.213709 | -6.258 |
| 49.23254 | -6.662 |
| 49.252694 | -6.651 |
| 49.279888 | -6.064 |
| 49.293421 | -5.898 |
| 49.313455 | -7.563 |
| 49.332545 | -9.212 |
| 49.358661 | -10.357 |
| 49.373602 | -10.907 |
| 49.393426 | -10.733 |
| 49.413463 | -9.824 |
| 49.44143 | -8.652 |
| 49.452562 | -8.696 |
| 49.473521 | -9.172 |
| 49.493332 | -9.259 |
| 49.5206 | -8.563 |
| 49.532829 | -8.518 |
| 49.552595 | -8.601 |
| 49.573302 | -9.514 |
| 49.603384 | -14.229 |
| 49.613564 | -15.417 |
| 49.632614 | -17.54 |
| 49.652631 | -18.348 |
| 49.684354 | -17.795 |
| 49.693479 | -17.777 |
| 49.71354 | -17.383 |
| 49.732576 | -16.57 |
| 49.763111 | -15.472 |
| 49.773629 | -15.031 |
| 49.79415 | -14.343 |
| 49.813531 | -14.818 |
| 49.843529 | -16.307 |
| 49.852721 | -16.748 |
| 49.873557 | -17.548 |
| 49.893719 | -18.175 |
| 49.92514 | -19.19 |
| 49.932622 | -19.559 |
| 49.952687 | -19.98 |
| 49.973594 | -19.619 |
| 50.004731 | -18.772 |
| 50.01376 | -18.148 |
| 50.032741 | -17.199 |
| 50.052576 | -16.901 |
| 50.098053 | -17.28 |
| 50.113544 | -17.58 |
| 50.132715 | -17.875 |
| 50.157362 | -17.722 |
| 50.173435 | -17.452 |
| 50.19516 | -17.074 |
| 50.213581 | -16.385 |
| 50.238522 | -16.013 |
| 50.252657 | -15.716 |
| 50.273554 | -15.343 |
| 50.295091 | -15.046 |
| 50.320449 | -14.807 |
| 50.332979 | -14.622 |
| 50.352597 | -14.473 |
| 50.373445 | -14.304 |
| 50.402366 | -13.012 |
| 50.413655 | -12.015 |
| 50.432958 | -10.421 |
| 50.45348 | -10.228 |
| 50.481551 | -9.292 |
| 50.493647 | -8.469 |
| 50.513581 | -8.253 |
| 50.532651 | -8.882 |
| 50.560575 | -9.657 |
| 50.573657 | -10.229 |
| 50.593532 | -10.706 |
| 50.614184 | -11.073 |
| 50.641628 | -11.344 |
| 50.652564 | -11.357 |
| 50.673454 | -11.094 |
| 50.694016 | -10.796 |
| 50.723968 | -9.872 |
| 50.752737 | -9.242 |
| 50.773435 | -8.741 |
| 50.804235 | -8.828 |
| 50.813527 | -9.203 |
| 50.832538 | -10.142 |
| 50.852591 | -11.163 |
| 50.883868 | -11.433 |
| 50.89358 | -11.176 |
| 50.913541 | -10.178 |
| 50.93261 | -9.048 |
| 50.964522 | -8.014 |
| 50.993624 | -7.485 |
| 51.013467 | -7.489 |
| 51.042592 | -7.926 |
| 51.052527 | -7.994 |
| 51.073814 | -8.126 |
| 51.093463 | -8.153 |
| 51.127222 | -8.587 |
| 51.136123 | -9.185 |
| 51.152678 | -9.766 |
| 51.173543 | -11.289 |
| 51.224509 | -11.439 |
| 51.253107 | -10.618 |
| 51.280292 | -9.504 |
| 51.293761 | -8.945 |
| 51.313564 | -8.806 |
| 51.33292 | -8.703 |
| 51.360278 | -8.541 |
| 51.373615 | -8.435 |
| 51.393322 | -8.096 |
| 51.413532 | -7.919 |
| 51.439742 | -8.524 |
| 51.452604 | -9.002 |
| 51.473506 | -10.326 |
| 51.493601 | -9.181 |
| 51.519853 | -11.429 |
| 51.53263 | -12.042 |
| 51.552767 | -12.758 |
| 51.573437 | -12.329 |
| 51.601194 | -10.559 |
| 51.61376 | -9.954 |
| 51.632719 | -9.14 |
| 51.652591 | -8.618 |
| 51.681538 | -8.294 |
| 51.693781 | -8.315 |
| 51.713527 | -8.62 |
| 51.732602 | -9.148 |
| 51.761736 | -9.575 |
| 51.773627 | -9.61 |
| 51.795331 | -9.786 |
| 51.813601 | -10.279 |
| 51.84325 | -10.71 |
| 51.852859 | -10.604 |
| 51.87344 | -10.022 |
| 51.893776 | -9.171 |
| 51.922907 | -8.678 |
| 51.932554 | -8.608 |
| 51.952778 | -8.645 |
| 51.973452 | -8.877 |
| 52.004804 | -9.686 |
| 52.013812 | -9.947 |
| 52.032578 | -10.986 |
| 52.052589 | -11.182 |
| 52.084846 | -10.708 |
| 52.093442 | -10.314 |
| 52.113528 | -9.344 |
| 52.132599 | -8.465 |
| 52.164424 | -7.7 |
| 52.173503 | -7.673 |
| 52.195192 | -6.825 |
| 52.21353 | -5.595 |
| 52.24429 | -3.761 |
| 52.252613 | -3.071 |
| 52.273456 | -1.852 |
| 52.293981 | -0.735 |
| 52.338784 | 0.916 |
| 52.352772 | 1.356 |
| 52.373367 | 1.906 |
| 52.39698 | 1.786 |
| 52.414023 | 1.114 |
| 52.433059 | 1.936 |
| 52.452605 | 1.419 |
| 52.479347 | 0.158 |
| 52.493589 | -1.41 |
| 52.513483 | -2.952 |
| 52.532612 | -4.722 |
| 52.559116 | -6.415 |
| 52.573508 | -7.233 |
| 52.594573 | -6.7 |
| 52.613573 | -6.565 |
| 52.639481 | -6.721 |
| 52.652673 | -6.565 |
| 52.673426 | -6.662 |
| 52.693495 | -6.9 |
| 52.720031 | -6.864 |
| 52.73332 | -6.815 |
| 52.752662 | -6.504 |
| 52.773435 | -6.197 |
| 52.802488 | -5.919 |
| 52.814161 | -5.816 |
| 52.832769 | -5.506 |
| 52.852678 | -5.02 |
| 52.882166 | -4.446 |
| 52.893985 | -4.354 |
| 52.913458 | -4.202 |
| 52.932705 | -4.851 |
| 52.964013 | -5.911 |
| 52.973544 | -6.274 |
| 52.994809 | -7.254 |
| 53.01348 | -8.739 |
| 53.043982 | -10.178 |
| 53.074017 | -9.73 |
| 53.093525 | -8.873 |
| 53.124473 | -7.455 |
| 53.133509 | -6.951 |
| 53.152565 | -6.374 |
| 53.173508 | -5.118 |
| 53.206219 | -5.994 |
| 53.214524 | -5.986 |
| 53.232586 | -5.94 |
| 53.252787 | -5.894 |
| 53.284964 | -6.074 |
| 53.312663 | -7.629 |
| 53.333073 | -9.104 |
| 53.362199 | -9.813 |
| 53.373525 | -9.66 |
| 53.395612 | -9.529 |
| 53.413592 | -9.696 |
| 53.459716 | -10.043 |
| 53.474738 | -9.931 |
| 53.496 | -9.584 |
| 53.518353 | -9.522 |
| 53.533746 | -9.502 |
| 53.552718 | -9.884 |
| 53.573763 | -11.339 |
| 53.600151 | -16.438 |
| 53.61391 | -17.935 |
| 53.632796 | -19.417 |
| 53.652836 | -19.006 |
| 53.679201 | -16.933 |
| 53.694021 | -16.56 |
| 53.713665 | -16.522 |
| 53.732705 | -17.219 |
| 53.7588 | -16.739 |
| 53.773467 | -16.272 |
| 53.794026 | -15.507 |
| 53.814189 | -14.759 |
| 53.839329 | -14.371 |
| 53.852536 | -14.953 |
| 53.873557 | -15.686 |
| 53.894139 | -16.654 |
| 53.920963 | -18.46 |
| 53.932762 | -19.296 |
| 53.952742 | -20.663 |
| 53.973588 | -21.114 |
| 54.002598 | -19.875 |
| 54.01418 | -19.27 |
| 54.032592 | -18.415 |
| 54.052584 | -16.786 |
| 54.082044 | -16.98 |
| 54.093386 | -17.516 |
| 54.113552 | -18.241 |
| 54.132624 | -18.291 |
| 54.162492 | -18.007 |
| 54.173691 | -17.696 |
| 54.195253 | -16.691 |
| 54.213523 | -16.376 |
| 54.242238 | -15.886 |
| 54.252588 | -15.775 |
| 54.273377 | -15.591 |
| 54.295655 | -15.518 |
| 54.324519 | -15.474 |
| 54.33313 | -15.203 |
| 54.352581 | -14.747 |
| 54.373415 | -14.189 |
| 54.404822 | -13.404 |
| 54.413475 | -12.749 |
| 54.432633 | -10.947 |
| 54.452589 | -9.45 |
| 54.500127 | -9.394 |
| 54.513782 | -9.699 |
| 54.532571 | -9.996 |
| 54.556155 | -10.231 |
| 54.573447 | -11.272 |
| 54.595399 | -11.7 |
| 54.613545 | -11.464 |
| 54.635842 | -11.578 |
| 54.652708 | -11.518 |
| 54.673479 | -10.635 |
| 54.696781 | -10.061 |
| 54.720065 | -9.699 |
| 54.73345 | -9.609 |
| 54.752724 | -9.58 |
| 54.773523 | -9.459 |
| 54.800492 | -9.639 |
| 54.814107 | -9.865 |
| 54.832586 | -10.414 |
| 54.852556 | -10.981 |
| 54.880052 | -10.535 |
| 54.893851 | -9.787 |
| 54.913765 | -8.979 |
| 54.932635 | -8.427 |
| 54.960575 | -8.399 |
| 54.973547 | -8.548 |
| 54.993399 | -8.718 |
| 55.013712 | -8.759 |
| 55.039408 | -8.629 |
| 55.052585 | -8.617 |
| 55.073538 | -8.67 |
| 55.093424 | -9.246 |
| 55.123333 | -9.199 |
| 55.134213 | -9.584 |
| 55.152578 | -10.411 |
| 55.173443 | -10.868 |
| 55.202324 | -11.196 |
| 55.214035 | -11.268 |
| 55.232573 | -11.049 |
| 55.252589 | -10.64 |
| 55.282226 | -10.011 |
| 55.293627 | -9.833 |
| 55.313524 | -9.283 |
| 55.333152 | -8.74 |
| 55.362272 | -8.4 |
| 55.373505 | -8.343 |
| 55.395803 | -8.063 |
| 55.413029 | -7.97 |
| 55.442454 | -7.7 |
| 55.452586 | -7.58 |
| 55.47347 | -7.603 |
| 55.497481 | -8.77 |
| 55.525873 | -11.305 |
| 55.552631 | -12.61 |
| 55.573473 | -12.281 |
| 55.620544 | -9.512 |
| 55.632677 | -9.159 |
| 55.652942 | -8.782 |
| 55.678409 | -8.829 |
| 55.693416 | -8.921 |
| 55.713628 | -9.137 |
| 55.732575 | -9.639 |
| 55.757825 | -10.509 |
| 55.773537 | -10.742 |
| 55.794213 | -10.952 |
| 55.815288 | -10.76 |
| 55.838848 | -10.109 |
| 55.852964 | -9.817 |
| 55.873694 | -9.253 |
| 55.893706 | -8.864 |
| 55.919258 | -8.546 |
| 55.932645 | -8.482 |
| 55.953037 | -8.401 |
| 55.973413 | -8.646 |
| 56.001458 | -9.82 |
| 56.013641 | -10.186 |
| 56.03303 | -10.641 |
| 56.052579 | -10.651 |
| 56.080587 | -10.448 |
| 56.093531 | -10.383 |
| 56.113663 | -10.065 |
| 56.132781 | -8.884 |
| 56.160555 | -8.528 |
| 56.173358 | -8.576 |
| 56.195572 | -8.298 |
| 56.212656 | -7.071 |
| 56.241269 | -4.867 |
| 56.252921 | -4.317 |
| 56.27341 | -3.136 |
| 56.296297 | -1.488 |
| 56.323143 | -0.584 |
| 56.33266 | -0.217 |
| 56.352578 | 0.327 |
| 56.373422 | 0.667 |
| 56.404796 | 0.651 |
| 56.413558 | 0.699 |
| 56.432698 | 0.699 |
| 56.452589 | 0.333 |
| 56.483677 | -1.214 |
| 56.493637 | -1.803 |
| 56.513588 | -3.087 |
| 56.532587 | -4.404 |
| 56.564908 | -6.514 |
| 56.595311 | -6.297 |
| 56.613549 | -6.233 |
| 56.643937 | -6.146 |
| 56.652638 | -6.282 |
| 56.673515 | -6.243 |
| 56.694167 | -6.203 |
| 56.739525 | -5.818 |
| 56.752622 | -5.64 |
| 56.773555 | -5.585 |
| 56.799251 | -5.804 |
| 56.813614 | -5.813 |
| 56.83272 | -5.869 |
| 56.852541 | -5.647 |
| 56.878654 | -5.371 |
| 56.89356 | -5.42 |
| 56.913128 | -5.489 |
| 56.932625 | -5.751 |
| 56.958285 | -6.084 |
| 56.973417 | -6.482 |
| 56.994247 | -6.828 |
| 57.014412 | -7.758 |
| 57.03853 | -8.848 |
| 57.05247 | -9.24 |
| 57.073483 | -9.631 |
| 57.093772 | -9.125 |
| 57.120621 | -7.994 |
| 57.132633 | -7.443 |
| 57.152579 | -6.333 |
| 57.17351 | -5.649 |
| 57.202342 | -5.309 |
| 57.213952 | -5.158 |
| 57.232658 | -5.316 |
| 57.252556 | -5.456 |
| 57.279767 | -5.662 |
| 57.293974 | -5.804 |
| 57.313613 | -6.135 |
| 57.332643 | -7.617 |
| 57.362458 | -9.997 |
| 57.373548 | -10.191 |
| 57.395826 | -10.109 |
| 57.413602 | -9.827 |
| 57.442225 | -9.559 |
| 57.452583 | -9.81 |
| 57.473457 | -10.616 |
| 57.492526 | -12.435 |
| 57.525287 | -14.881 |
| 57.552599 | -15.45 |
| 57.573424 | -15.858 |
| 57.605084 | -17.365 |
| 57.632619 | -17.74 |
| 57.652575 | -17.25 |
| 57.684548 | -16.532 |
| 57.713544 | -16.257 |
| 57.73272 | -16.52 |
| 57.765237 | -14.763 |
| 57.773386 | -14.786 |
| 57.795705 | -14.946 |
| 57.813724 | -14.763 |
| 57.859398 | -14.626 |
| 57.873223 | -14.713 |
| 57.895302 | -15.267 |
| 57.919393 | -16.021 |
| 57.934293 | -16.215 |
| 57.952566 | -17.212 |
| 57.973503 | -20.707 |
| 58.002654 | -20.917 |
| 58.013869 | -20.699 |
| 58.032672 | -19.971 |
| 58.052574 | -18.701 |
| 58.079548 | -16.609 |
| 58.09354 | -16.217 |
| 58.113514 | -16.004 |
| 58.132632 | -16.068 |
| 58.160702 | -16.686 |
| 58.173502 | -17.526 |
| 58.193438 | -18.107 |
| 58.213518 | -17.962 |
| 58.239727 | -16.893 |
| 58.252538 | -16.247 |
| 58.273385 | -15.645 |
| 58.293527 | -15.041 |
| 58.318657 | -14.566 |
| 58.334904 | -14.213 |
| 58.352564 | -14.025 |
| 58.372624 | -13.796 |
| 58.40284 | -13.599 |
| 58.415063 | -13.408 |
| 58.432709 | -12.159 |
| 58.452572 | -10.729 |
| 58.483776 | -10.071 |
| 58.493594 | -10.093 |
| 58.513557 | -10.217 |
| 58.532666 | -10.405 |
| 58.564166 | -11.407 |
| 58.57368 | -11.303 |
| 58.595387 | -10.895 |
| 58.613511 | -10.238 |
| 58.64299 | -9.62 |
| 58.652668 | -9.532 |
| 58.673416 | -9.575 |
| 58.693537 | -9.622 |
| 58.723347 | -9.75 |
| 58.732884 | -9.825 |
| 58.75257 | -10.207 |
| 58.773499 | -10.527 |
| 58.805266 | -10.706 |
| 58.832643 | -11.457 |
| 58.852753 | -11.48 |
| 58.902426 | -10.254 |
| 58.913886 | -9.786 |
| 58.932646 | -9.026 |
| 58.957381 | -8.267 |
| 58.973507 | -8.033 |
| 58.995413 | -7.625 |
| 59.013495 | -7.672 |
| 59.038022 | -7.36 |
| 59.052652 | -7.312 |
| 59.073552 | -8.26 |
| 59.095638 | -8.256 |
| 59.121355 | -9.588 |
| 59.133481 | -10.471 |
| 59.152615 | -11.89 |
| 59.173413 | -12.82 |
| 59.200389 | -11.927 |
| 59.213546 | -11.326 |
| 59.23259 | -10.156 |
| 59.252579 | -9.681 |
| 59.280611 | -9.268 |
| 59.293285 | -9.097 |
| 59.313594 | -8.805 |
| 59.332576 | -8.675 |
| 59.361166 | -8.505 |
| 59.373666 | -8.524 |
| 59.393633 | -8.403 |
| 59.41371 | -8.48 |
| 59.440914 | -9.422 |
| 59.452669 | -9.732 |
| 59.473435 | -10.414 |
| 59.493501 | -11.186 |
| 59.523223 | -11.723 |
| 59.533294 | -11.43 |
| 59.552624 | -10.584 |
| 59.573419 | -9.661 |
| 59.60532 | -8.821 |
| 59.632582 | -8.812 |
| 59.652664 | -8.579 |
| 59.683939 | -8.583 |
| 59.693751 | -8.744 |
| 59.713519 | -9.26 |
| 59.732584 | -9.708 |
| 59.765134 | -10.072 |
| 59.795987 | -10.165 |
| 59.813512 | -10.166 |
| 59.843971 | -10.13 |
| 59.852591 | -9.962 |
| 59.873552 | -9.446 |
| 59.893611 | -9.385 |
| 59.924991 | -9.535 |
| 59.932854 | -9.609 |
| 59.952672 | -9.935 |
| 59.973423 | -10.307 |
| 60.022758 | -9.772 |
| 60.032529 | -9.603 |
| 60.052561 | -9.188 |
| 60.075989 | -8.593 |
| 60.093404 | -8.171 |
| 60.113508 | -7.902 |
| 60.132867 | -7.311 |
| 60.15825 | -6.39 |
| 60.173464 | -5.668 |
| 60.193517 | -4.28 |
| 60.213501 | -3.621 |
| 60.237852 | -0.222 |
| 60.252558 | 0.822 |
| 60.273733 | 3.048 |
| 60.294043 | 3.519 |
| 60.319402 | 2.443 |
| 60.332594 | 2.118 |
| 60.352827 | 1.782 |
| 60.373409 | 0.756 |
| 60.401125 | 1.42 |
| 60.41401 | 0.871 |
| 60.432708 | -0.535 |
| 60.452616 | -2.108 |
| 60.481448 | -5.147 |
| 60.493555 | -6.405 |
| 60.512834 | -9.217 |
| 60.532687 | -9.195 |
| 60.562274 | -8.192 |
| 60.57309 | -7.8 |
| 60.596083 | -7.248 |
| 60.613534 | -6.768 |
| 60.641663 | -6.539 |
| 60.652629 | -6.224 |
| 60.673497 | -6.17 |
| 60.697932 | -6.228 |
| 60.724963 | -5.795 |
| 60.752652 | -5.413 |
| 60.773455 | -4.96 |
| 60.805024 | -4.607 |
| 60.833114 | -4.496 |
| 60.852623 | -4.62 |
| 60.883442 | -4.932 |
| 60.894387 | -4.903 |
| 60.913695 | -5.24 |
| 60.932594 | -6.188 |
| 60.964226 | -9.244 |
| 60.995235 | -9.748 |
| 61.013834 | -9.087 |
| 61.04544 | -8.051 |
| 61.073426 | -7.038 |
| 61.094743 | -6.132 |
| 61.141195 | -5.739 |
| 61.152732 | -6.152 |
| 61.173532 | -7.015 |
| 61.199897 | -7.478 |
| 61.214758 | -7.195 |
| 61.232748 | -6.698 |
| 61.252567 | -6.781 |
| 61.278189 | -8.325 |
| 61.292982 | -9.052 |
| 61.313341 | -9.257 |
| 61.332622 | -8.523 |
| 61.360725 | -7.757 |
| 61.373493 | -7.817 |
| 61.394142 | -8.073 |
| 61.413547 | -9.038 |
| 61.440013 | -9.735 |
| 61.452542 | -10.005 |
| 61.473514 | -10.744 |
| 61.493423 | -11.269 |
| 61.520367 | -14.189 |
| 61.53268 | -15.297 |
| 61.552628 | -16.942 |
| 61.573443 | -17.972 |
| 61.601739 | -17.786 |
| 61.613852 | -18.17 |
| 61.632565 | -17.306 |
| 61.652571 | -15.421 |
| 61.681959 | -17.026 |
| 61.693631 | -17.767 |
| 61.713505 | -17.976 |
| 61.732575 | -16.534 |
| 61.762668 | -13.4 |
| 61.773502 | -13.741 |
| 61.795603 | -14.441 |
| 61.813498 | -15.218 |
| 61.842607 | -16.89 |
| 61.852584 | -17.608 |
| 61.873422 | -19.152 |
| 61.893536 | -20.27 |
| 61.923936 | -20.544 |
| 61.932813 | -20.503 |
| 61.952561 | -19.898 |
| 61.973411 | -19.117 |
| 62.005396 | -17.172 |
| 62.013474 | -16.617 |
| 62.032582 | -16.325 |
| 62.052575 | -15.91 |
| 62.085669 | -16.484 |
| 62.09348 | -16.862 |
| 62.113506 | -17.592 |
| 62.132655 | -17.613 |
| 62.166038 | -16.852 |
| 62.173377 | -16.797 |
| 62.195388 | -17.055 |
| 62.213433 | -16.73 |
| 62.260619 | -15.068 |
| 62.273542 | -14.539 |
| 62.295307 | -14.343 |
| 62.319453 | -13.884 |
| 62.332636 | -13.468 |
| 62.352571 | -12.887 |
| 62.373432 | -12.198 |
| 62.400901 | -10.403 |
| 62.413997 | -9.949 |
| 62.432587 | -9.791 |
| 62.452557 | -9.82 |
| 62.480576 | -10.013 |
| 62.493813 | -10.068 |
| 62.513643 | -10.354 |
| 62.532535 | -10.763 |
| 62.558438 | -10.959 |
| 62.573518 | -10.967 |
| 62.593561 | -11.054 |
| 62.613449 | -11.045 |
| 62.639806 | -11.058 |
| 62.652528 | -10.953 |
| 62.672873 | -10.76 |
| 62.693412 | -10.557 |
| 62.723182 | -10.232 |
| 62.732658 | -10.046 |
| 62.752629 | -9.774 |
| 62.773402 | -9.685 |
| 62.802699 | -9.406 |
| 62.813544 | -9.294 |
| 62.832668 | -9.023 |
| 62.852584 | -8.751 |
| 62.882736 | -8.357 |
| 62.893489 | -8.346 |
| 62.912802 | -8.311 |
| 62.932575 | -8.136 |
| 62.963413 | -7.934 |
| 62.972928 | -7.876 |
| 62.995594 | -7.762 |
| 63.013605 | -7.745 |
| 63.04355 | -8.355 |
| 63.052581 | -9.019 |
| 63.073439 | -10.756 |
| 63.093338 | -12.274 |
| 63.122862 | -12.179 |
| 63.133095 | -11.681 |
| 63.15256 | -10.614 |
| 63.1735 | -9.761 |
| 63.204129 | -8.808 |
| 63.213874 | -8.562 |
| 63.232571 | -8.422 |
| 63.252734 | -8.484 |
| 63.301506 | -8.899 |
| 63.313535 | -8.872 |
| 63.332637 | -9.181 |
| 63.356817 | -9.554 |
| 63.373449 | -10.06 |
| 63.393216 | -10.703 |
| 63.413515 | -11.047 |
| 63.436296 | -10.648 |
| 63.452527 | -10.931 |
| 63.473565 | -10.205 |
| 63.497737 | -9.142 |
| 63.521197 | -9.432 |
| 63.532811 | -9.678 |
| 63.55267 | -10.054 |
| 63.573476 | -9.948 |
| 63.602371 | -9.989 |
| 63.613849 | -9.819 |
| 63.633162 | -9.434 |
| 63.652835 | -9.277 |
| 63.679767 | -9.102 |
| 63.693815 | -8.785 |
| 63.71295 | -9.249 |
| 63.732558 | -9.12 |
| 63.760524 | -8.57 |
| 63.773525 | -8.787 |
| 63.793356 | -9.437 |
| 63.814641 | -10.533 |
| 63.841065 | -11.155 |
| 63.852525 | -11.533 |
| 63.873424 | -11.477 |
| 63.893728 | -10.779 |
| 63.922824 | -9.997 |
| 63.933048 | -9.895 |
| 63.952497 | -9.559 |
| 63.973432 | -9.964 |
| 64.003601 | -10.588 |
| 64.013994 | -10.587 |
| 64.032581 | -10.202 |
| 64.052484 | -10.025 |
| 64.082995 | -8.715 |
| 64.093055 | -8.325 |
| 64.113642 | -7.28 |
| 64.132485 | -6.568 |
| 64.163708 | -4.745 |
| 64.173498 | -4.011 |
| 64.195439 | -2.729 |
| 64.213417 | -2.432 |
| 64.241889 | -0.868 |
| 64.252563 | 0.17 |
| 64.273444 | 2.297 |
| 64.292771 | 3.039 |
| 64.325415 | 1.512 |
| 64.352588 | 0.945 |
| 64.373411 | -1.085 |
| 64.423042 | -5.166 |
| 64.432532 | -5.729 |
| 64.452718 | -6.801 |
| 64.479084 | -7.619 |
| 64.493787 | -7.651 |
| 64.513422 | -7.279 |
| 64.533349 | -6.975 |
| 64.55881 | -6.608 |
| 64.573911 | -6.688 |
| 64.593843 | -6.282 |
| 64.613421 | -6.057 |
| 64.637336 | -5.651 |
| 64.652706 | -5.495 |
| 64.673957 | -5.269 |
| 64.693329 | -4.991 |
| 64.717469 | -4.394 |
| 64.732625 | -4.07 |
| 64.753188 | -3.933 |
| 64.773426 | -3.918 |
| 64.800127 | -4.183 |
| 64.814561 | -4.392 |
| 64.832667 | -4.977 |
| 64.852619 | -5.372 |
| 64.880824 | -6.459 |
| 64.89449 | -7.017 |
| 64.913508 | -7.968 |
| 64.932675 | -9.089 |
| 64.9634 | -9.6 |
| 64.973415 | -9.224 |
| 64.995195 | -8.688 |
| 65.013893 | -8.346 |
| 65.040651 | -7.479 |
| 65.052711 | -7.133 |
| 65.073431 | -6.358 |
| 65.094786 | -6.087 |
| 65.122699 | -6.268 |
| 65.13262 | -6.135 |
| 65.152552 | -5.866 |
| 65.173341 | -5.771 |
| 65.203593 | -5.85 |
| 65.213519 | -6.094 |
| 65.232609 | -7.396 |
| 65.252565 | -9.502 |
| 65.283135 | -10.374 |
| 65.293552 | -10.478 |
| 65.31357 | -10.097 |
| 65.332567 | -9.153 |
| 65.364646 | -8.432 |
| 65.373511 | -8.221 |
| 65.395209 | -8.57 |
| 65.413657 | -9.397 |
| 65.444897 | -10.208 |
| 65.452531 | -10.354 |
| 65.473406 | -10.391 |
| 65.494212 | -10.721 |
| 65.542148 | -15.409 |
| 65.552974 | -16.746 |
| 65.573418 | -18.849 |
| 65.60305 | -19.574 |
| 65.634573 | -18.337 |
| 65.652606 | -17.562 |
| 65.680402 | -15.949 |
| 65.693724 | -15.541 |
| 65.71368 | -15.292 |
| 65.732463 | -15.108 |
| 65.758696 | -13.818 |
| 65.77352 | -13.54 |
| 65.794082 | -14.251 |
| 65.814169 | -14.823 |
| 65.842231 | -16.723 |
| 65.852558 | -17.383 |
| 65.873451 | -19.4 |
| 65.894132 | -21.439 |
| 65.924663 | -20.396 |
| 65.952554 | -18.968 |
| 65.97332 | -16.859 |
| 66.002748 | -16.624 |
| 66.014302 | -16.84 |
| 66.032567 | -17.276 |
| 66.052599 | -17.868 |
| 66.079995 | -17.723 |
| 66.094076 | -17.674 |
| 66.113424 | -17.613 |
| 66.132565 | -17.219 |
| 66.165313 | -16.544 |
| 66.195083 | -15.666 |
| 66.213532 | -15.45 |
| 66.243651 | -14.772 |
| 66.252601 | -14.634 |
| 66.273496 | -14.18 |
| 66.293332 | -13.789 |
| 66.322199 | -13.256 |
| 66.332889 | -13.01 |
| 66.352609 | -11.758 |
| 66.373413 | -10.011 |
| 66.406142 | -9.788 |
| 66.432564 | -8.666 |
| 66.452551 | -8.144 |
| 66.487674 | -8.936 |
| 66.513586 | -9.638 |
| 66.532601 | -10.31 |
| 66.574401 | -11.333 |
| 66.593377 | -11.076 |
| 66.613935 | -10.701 |
| 66.661541 | -10.705 |
| 66.676815 | -10.469 |
| 66.695304 | -10.031 |
| 66.720162 | -10.108 |
| 66.733015 | -10.337 |
| 66.752699 | -10.834 |
| 66.773416 | -11.063 |
| 66.801781 | -10.6 |
| 66.813753 | -10.339 |
| 66.832708 | -9.583 |
| 66.852597 | -8.705 |
| 66.881134 | -8.033 |
| 66.893513 | -7.708 |
| 66.913563 | -7.279 |
| 66.932573 | -7.207 |
| 66.962976 | -7.325 |
| 66.973216 | -7.269 |
| 66.995645 | -7.297 |
| 67.013502 | -7.419 |
| 67.040708 | -10.304 |
| 67.052513 | -11.374 |
| 67.0735 | -12.693 |
| 67.095472 | -12.344 |
| 67.123338 | -10.757 |
| 67.132829 | -10.346 |
| 67.152562 | -9.605 |
| 67.173267 | -9.375 |
| 67.203836 | -9.057 |
| 67.213629 | -9.05 |
| 67.232503 | -8.881 |
| 67.252553 | -8.885 |
| 67.285986 | -8.95 |
| 67.293468 | -9.033 |
| 67.313572 | -9.227 |
| 67.3325 | -9.015 |
| 67.363706 | -9.245 |
| 67.373496 | -9.394 |
| 67.395364 | -9.731 |
| 67.413742 | -10.305 |
| 67.44377 | -10.585 |
| 67.452557 | -10.641 |
| 67.473417 | -10.53 |
| 67.493681 | -10.493 |
| 67.528377 | -10.03 |
| 67.552607 | -9.261 |
| 67.573399 | -8.947 |
| 67.606891 | -8.972 |
| 67.613309 | -8.849 |
| 67.632589 | -8.548 |
| 67.652548 | -8.31 |
| 67.704808 | -8.742 |
| 67.71359 | -9.087 |
| 67.732997 | -9.919 |
| 67.75869 | -10.514 |
| 67.773605 | -10.681 |
| 67.794189 | -10.333 |
| 67.813425 | -9.782 |
| 67.837334 | -9.304 |
| 67.852579 | -9.081 |
| 67.872589 | -9.252 |
| 67.895505 | -9.446 |
| 67.921153 | -9.885 |
| 67.932734 | -10.207 |
| 67.952553 | -11.14 |
| 67.973696 | -11.745 |
| 68.001356 | -11.322 |
| 68.013744 | -10.816 |
| 68.032595 | -9.491 |
| 68.052553 | -8.212 |
| 68.081339 | -6.26 |
| 68.093581 | -5.663 |
| 68.11349 | -4.681 |
| 68.132561 | -3.601 |
| 68.161725 | -1.955 |
| 68.173404 | -1.341 |
| 68.195318 | -1.508 |
| 68.232497 | -0.537 |
| 68.262609 | 0.842 |
| 68.273427 | 1.026 |
| 68.295309 | 1.081 |
| 68.313491 | 0.692 |
| 68.340942 | 0.433 |
| 68.352614 | 0.079 |
| 68.373446 | -0.825 |
| 68.397864 | -1.917 |
| 68.424948 | -3.757 |
| 68.433035 | -4.447 |
| 68.452588 | -5.744 |
| 68.473416 | -6.776 |
| 68.505053 | -7.749 |
| 68.51404 | -7.459 |
| 68.533239 | -6.458 |
| 68.552841 | -5.72 |
| 68.586632 | -5.223 |
| 68.593224 | -5.145 |
| 68.613486 | -4.878 |
| 68.632832 | -5.221 |
| 68.664752 | -5.889 |
| 68.673429 | -6.046 |
| 68.696238 | -5.92 |
| 68.713154 | -5.721 |
| 68.744826 | -5.627 |
| 68.752587 | -5.665 |
| 68.773469 | -5.528 |
| 68.793538 | -5.343 |
| 68.83986 | -4.878 |
| 68.85334 | -5.495 |
| 68.873412 | -6.279 |
| 68.901261 | -7.128 |
| 68.915158 | -7.464 |
| 68.932539 | -7.772 |
| 68.952547 | -8.653 |
| 68.980835 | -9.172 |
| 68.993728 | -8.873 |
| 69.013419 | -7.93 |
| 69.0329 | -6.803 |
| 69.060035 | -5.641 |
| 69.073587 | -5.428 |
| 69.093419 | -5.425 |
| 69.113501 | -5.477 |
| 69.140207 | -5.459 |
| 69.15262 | -5.908 |
| 69.173388 | -6.057 |
| 69.193314 | -6.563 |
| 69.221037 | -8.638 |
| 69.232826 | -9.134 |
| 69.252547 | -9.628 |
| 69.27344 | -9.773 |
| 69.305422 | -10.025 |
| 69.313282 | -9.9 |
| 69.332561 | -9.141 |
| 69.352622 | -8.495 |
| 69.383279 | -9.089 |
| 69.393744 | -9.267 |
| 69.413498 | -9.652 |
| 69.432568 | -10.122 |
| 69.464479 | -11.579 |
| 69.473487 | -12.263 |
| 69.494724 | -12.663 |
| 69.513412 | -13.51 |
| 69.544534 | -14.512 |
| 69.552657 | -14.507 |
| 69.573484 | -14.961 |
| 69.593514 | -15.466 |
| 69.622389 | -16.113 |
| 69.652586 | -15.991 |
| 69.67339 | -16.043 |
| 69.703523 | -15.572 |
| 69.713727 | -15.245 |
| 69.732572 | -13.703 |
| 69.75258 | -12.354 |
| 69.784431 | -11.88 |
| 69.79354 | -13.311 |
| 69.813499 | -14.753 |
| 69.832558 | -19.98 |
| 69.866408 | -19.864 |
| 69.873199 | -19.472 |
| 69.895573 | -20.291 |
| 69.913651 | -19.867 |
| 69.961857 | -17.998 |
| 69.973341 | -17.811 |
| 69.995027 | -17.806 |
| 70.021994 | -18.036 |
| 70.032595 | -18.179 |
| 70.052625 | -18.451 |
| 70.073412 | -18.495 |
| 70.100084 | -18.427 |
| 70.113192 | -18.729 |
| 70.132619 | -18.846 |
| 70.152433 | -18.405 |
| 70.178959 | -17.544 |
| 70.196821 | -16.397 |
| 70.213486 | -15.567 |
| 70.23272 | -14.899 |
| 70.258431 | -14.829 |
| 70.273461 | -15.206 |
| 70.295443 | -15.226 |
| 70.313497 | -14.885 |
| 70.339104 | -14.555 |
| 70.352473 | -14.18 |
| 70.373187 | -13.882 |
| 70.39526 | -13.206 |
| 70.42261 | -10.396 |
| 70.4326 | -8.816 |
| 70.452574 | -6.528 |
| 70.473368 | -5.519 |
| 70.502888 | -4.786 |
| 70.514428 | -4.375 |
| 70.532566 | -2.63 |
| 70.55254 | 0.098 |
| 70.583663 | 4.289 |
| 70.593502 | 5.253 |
| 70.613486 | 6.048 |
| 70.63256 | 5.963 |
| 70.687703 | -0.544 |
| 70.71409 | -4.118 |
| 70.744091 | -11.767 |
| 70.773467 | -15.279 |
| 70.793963 | -16.752 |
| 70.825069 | -17.405 |
| 70.852674 | -18.725 |
| 70.873527 | -17.075 |
| 70.906999 | -14.141 |
| 70.932473 | -11.658 |
| 70.952586 | -10.949 |
| 71.00167 | -8.423 |
| 71.014186 | -8.183 |
| 71.033085 | -8.226 |
| 71.057461 | -8.441 |
| 71.073416 | -8.448 |
| 71.095285 | -8.433 |
| 71.113496 | -8.613 |
| 71.138169 | -9.152 |
| 71.152916 | -9.8 |
| 71.173471 | -10.118 |
| 71.19542 | -9.897 |
| 71.223895 | -9.858 |
| 71.233235 | -10.157 |
| 71.252657 | -10.32 |
| 71.273385 | -10.581 |
| 71.302099 | -9.744 |
| 71.313991 | -9.392 |
| 71.332542 | -9.01 |
| 71.352559 | -9.741 |
| 71.382572 | -8.941 |
| 71.39358 | -8.864 |
| 71.413211 | -8.941 |
| 71.432552 | -8.742 |
| 71.462479 | -9.116 |
| 71.473604 | -9.293 |
| 71.495312 | -9.576 |
| 71.513487 | -9.787 |
| 71.543615 | -10.26 |
| 71.552649 | -10.429 |
| 71.573438 | -10.623 |
| 71.593421 | -10.359 |
| 71.623912 | -9.245 |
| 71.63253 | -9.113 |
| 71.652692 | -9.009 |
| 71.672871 | -8.953 |
| 71.705095 | -9.473 |
| 71.732611 | -9.659 |
| 71.752623 | -9.775 |
| 71.786126 | -9.865 |
| 71.813714 | -9.997 |
| 71.832551 | -9.976 |
| 71.865914 | -9.997 |
| 71.873268 | -9.968 |
| 71.895149 | -9.994 |
| 71.913473 | -10.012 |
| 71.945524 | -9.929 |
| 71.952579 | -9.844 |
| 71.973388 | -9.656 |
| 71.993586 | -9.481 |
| 72.025674 | -9.457 |
| 72.032619 | -9.411 |
| 72.052523 | -9.522 |
| 72.073459 | -9.585 |
| 72.123125 | -9.383 |
| 72.132873 | -9.376 |
| 72.152542 | -9.527 |
| 72.17945 | -9.671 |
| 72.193681 | -9.688 |
| 72.213413 | -9.572 |
| 72.232763 | -9.64 |
| 72.260903 | -9.8 |
| 72.273482 | -9.762 |
| 72.293503 | -9.704 |
| 72.313484 | -9.657 |
| 72.34128 | -9.791 |
| 72.352597 | -9.763 |
| 72.373393 | -9.621 |
| 72.393535 | -9.612 |
| 72.421387 | -9.708 |
| 72.433231 | -9.735 |
| 72.452632 | -9.846 |
| 72.473386 | -9.836 |
| 72.50393 | -9.762 |
| 72.51379 | -9.688 |
| 72.53255 | -9.567 |
| 72.552537 | -9.428 |
| 72.583215 | -9.402 |
| 72.593501 | -9.356 |
| 72.61348 | -9.493 |
| 72.63261 | -9.558 |
| 72.663715 | -9.447 |
| 72.673475 | -9.504 |
| 72.69518 | -9.552 |
| 72.713498 | -9.586 |
| 72.743507 | -9.558 |
| 72.752836 | -9.502 |
| 72.773421 | -9.578 |
| 72.793516 | -9.654 |
| 72.852523 | -9.813 |
| 72.873386 | -9.716 |
| 72.905872 | -9.747 |
| 72.913309 | -9.861 |
| 72.932582 | -10.018 |
| 72.952656 | -10.323 |
| 72.988859 | -10.294 |
| 72.993001 | -10.127 |
| 73.013508 | -9.905 |
| 73.03297 | -9.84 |
| 73.065742 | -9.801 |
| 73.073276 | -9.904 |
| 73.095637 | -10.035 |
| 73.113366 | -10.054 |
| 73.143994 | -10.083 |
| 73.152561 | -10.036 |
| 73.17341 | -9.67 |
| 73.193497 | -9.737 |
| 73.23995 | -9.859 |
| 73.253777 | -9.822 |
| 73.273483 | -9.85 |
| 73.301673 | -9.97 |
| 73.313696 | -9.941 |
| 73.333505 | -9.887 |
| 73.352556 | -9.897 |
| 73.383629 | -10.033 |
| 73.394732 | -10.035 |
| 73.412945 | -9.981 |
| 73.432723 | -10.019 |
| 73.462248 | -9.962 |
| 73.473517 | -9.906 |
| 73.492573 | -9.905 |
| 73.513482 | -9.859 |
| 73.540807 | -9.888 |
| 73.553212 | -9.738 |
| 73.572635 | -9.68 |
| 73.597102 | -9.578 |
| 73.62363 | -9.59 |
| 73.65254 | -9.689 |
| 73.673449 | -9.635 |
| 73.703399 | -9.787 |
| 73.713598 | -9.842 |
| 73.73253 | -9.878 |
| 73.752589 | -10.045 |
| 73.783068 | -10.174 |
| 73.793463 | -10.193 |
| 73.81349 | -10.091 |
| 73.832838 | -10.018 |
| 73.862696 | -9.811 |
| 73.873471 | -9.774 |
| 73.895103 | -9.812 |
| 73.913518 | -9.813 |
| 73.943888 | -9.861 |
| 73.952574 | -9.852 |
| 73.973483 | -9.729 |
| 73.993184 | -9.701 |
| 74.027086 | -9.749 |
| 74.032743 | -9.777 |
| 74.052602 | -9.822 |
| 74.07358 | -9.849 |
| 74.105432 | -9.824 |
| 74.113721 | -9.779 |
| 74.132533 | -9.841 |
| 74.152657 | -9.779 |
| 74.183934 | -9.784 |
| 74.193945 | -9.745 |
| 74.213532 | -9.757 |
| 74.232553 | -9.824 |
| 74.264453 | -9.914 |
| 74.273444 | -9.942 |
| 74.295912 | -9.905 |
| 74.313477 | -9.896 |
| 74.360958 | -9.839 |
| 74.373462 | -9.84 |
| 74.395818 | -9.786 |
| 74.420968 | -9.74 |
| 74.432541 | -9.749 |
| 74.453203 | -9.774 |
| 74.473368 | -9.906 |
| 74.500718 | -9.925 |
| 74.514994 | -9.888 |
| 74.53295 | -9.814 |
| 74.552568 | -9.832 |
| 74.580512 | -9.832 |
| 74.594191 | -9.831 |
| 74.613518 | -9.952 |
| 74.632542 | -9.925 |
| 74.659635 | -9.851 |
| 74.673456 | -9.804 |
| 74.693508 | -9.853 |
| 74.71438 | -9.804 |
| 74.739801 | -9.881 |
| 74.75248 | -9.816 |
| 74.773438 | -9.852 |
| 74.793503 | -9.764 |
| 74.820249 | -9.701 |
| 74.832951 | -9.776 |
| 74.85255 | -9.843 |
| 74.87346 | -9.84 |
| 74.902569 | -9.792 |
| 74.913935 | -9.803 |
| 74.932536 | -9.852 |
| 74.952538 | -9.973 |
| 74.982681 | -9.961 |
| 74.993545 | -9.933 |
| 75.013358 | -9.703 |
| 75.032539 | -9.732 |
| 75.062413 | -9.841 |
| 75.073481 | -9.794 |
| 75.095282 | -9.85 |
| 75.113702 | -9.879 |
| 75.142656 | -9.851 |
| 75.152546 | -9.934 |
| 75.173376 | -9.83 |
| 75.193582 | -9.878 |
| 75.222461 | -9.98 |
| 75.232764 | -9.943 |
| 75.252534 | -9.907 |
| 75.273388 | -9.982 |
| 75.303646 | -9.918 |
| 75.314014 | -9.918 |
| 75.332669 | -9.908 |
| 75.352414 | -9.88 |
| 75.396991 | -9.544 |
| 75.413826 | -9.571 |
| 75.432525 | -9.656 |
| 75.454134 | -9.703 |
| 75.473518 | -9.731 |
| 75.495899 | -9.644 |
| 75.513678 | -9.655 |
| 75.533942 | -9.816 |
| 75.552485 | -9.945 |
| 75.573488 | -10.13 |
| 75.597748 | -10.083 |
| 75.619148 | -9.898 |
| 75.632915 | -9.851 |
| 75.652651 | -9.797 |
| 75.673374 | -9.74 |
| 75.698249 | -9.832 |
| 75.713785 | -9.869 |
| 75.732927 | -9.851 |
| 75.752647 | -9.787 |
| 75.778173 | -9.73 |
| 75.795791 | -9.805 |
| 75.813553 | -9.871 |
| 75.832656 | -10.019 |
| 75.856648 | -10.037 |
| 75.873334 | -10 |
| 75.895281 | -9.888 |
| 75.913549 | -9.879 |
| 75.937573 | -9.757 |
| 75.95266 | -9.693 |
| 75.973322 | -9.656 |
| 75.99582 | -9.675 |
| 76.021533 | -9.674 |
| 76.032535 | -9.814 |
| 76.052706 | -9.627 |
| 76.073393 | -9.814 |
| 76.100058 | -9.86 |
| 76.113702 | -9.85 |
| 76.132531 | -9.871 |
| 76.152538 | -9.881 |
| 76.179296 | -9.889 |
| 76.19367 | -9.805 |
| 76.213508 | -9.759 |
| 76.233096 | -9.805 |
| 76.258792 | -9.972 |
| 76.273466 | -9.982 |
| 76.293264 | -10.075 |
| 76.313471 | -10.066 |
| 76.339859 | -10.055 |
| 76.352555 | -10.008 |
| 76.373376 | -9.898 |
| 76.394225 | -9.834 |
| 76.419963 | -9.618 |
| 76.432622 | -9.581 |
| 76.452508 | -9.675 |
| 76.473546 | -9.73 |
| 76.520172 | -9.769 |
| 76.533018 | -9.768 |
| 76.552607 | -9.721 |
| 76.574449 | -9.899 |
| 76.593966 | -9.851 |
| 76.613473 | -9.925 |
| 76.632691 | -9.917 |
| 76.655867 | -9.731 |
| 76.673581 | -9.769 |
| 76.693372 | -9.834 |
| 76.71397 | -9.899 |
| 76.734884 | -9.927 |
| 76.75246 | -9.814 |
| 76.773381 | -9.806 |
| 76.793424 | -9.732 |
| 76.816213 | -9.676 |
| 76.832969 | -9.76 |
| 76.852685 | -9.806 |
| 76.873381 | -9.833 |
| 76.897904 | -9.88 |
| 76.914002 | -9.955 |
| 76.932497 | -9.954 |
| 76.952529 | -9.962 |
| 76.977881 | -9.99 |
| 76.995178 | -9.871 |
| 77.013545 | -9.825 |
| 77.032446 | -9.731 |
| 77.05522 | -9.703 |
| 77.073304 | -9.768 |
| 77.095204 | -9.703 |
| 77.113566 | -9.722 |
| 77.136596 | -9.835 |
| 77.152606 | -9.887 |
| 77.173382 | -9.896 |
| 77.195902 | -9.852 |
| 77.219445 | -9.89 |
| 77.232851 | -9.788 |
| 77.252527 | -9.742 |
| 77.273442 | -9.733 |
| 77.301031 | -9.825 |
| 77.313725 | -9.834 |
| 77.332543 | -9.87 |
| 77.352522 | -9.693 |
| 77.379733 | -9.544 |
| 77.393414 | -9.563 |
| 77.413559 | -9.647 |
| 77.432531 | -9.749 |
| 77.459588 | -9.852 |
| 77.473332 | -9.833 |
| 77.49342 | -10.001 |
| 77.513466 | -10.141 |
| 77.540514 | -9.944 |
| 77.552679 | -10.002 |
| 77.573389 | -9.825 |
| 77.593488 | -9.721 |
| 77.638067 | -9.759 |
| 77.653521 | -9.87 |
| 77.673452 | -9.851 |
| 77.697047 | -9.871 |
| 77.714757 | -9.945 |
| 77.732636 | -9.972 |
| 77.752559 | -9.999 |
| 77.77621 | -10 |
| 77.795588 | -10.009 |
| 77.813475 | -9.786 |
| 77.832542 | -9.628 |
| 77.855544 | -9.49 |
| 77.873457 | -9.565 |
| 77.894188 | -9.675 |
| 77.913503 | -9.675 |
| 77.936973 | -9.581 |
| 77.95262 | -9.533 |
| 77.973378 | -9.431 |
| 77.995416 | -9.47 |
| 78.018473 | -9.469 |
| 78.032662 | -9.58 |
| 78.05253 | -9.719 |
| 78.073392 | -9.955 |
| 78.100023 | -10.392 |
| 78.11341 | -10.494 |
| 78.132523 | -10.676 |
| 78.152533 | -10.786 |
| 78.179331 | -10.592 |
| 78.193568 | -10.378 |
| 78.21322 | -10.054 |
| 78.232537 | -9.727 |
| 78.258926 | -9.3 |
| 78.273446 | -9.198 |
| 78.293486 | -9.505 |
| 78.313471 | -9.579 |
| 78.339915 | -9.909 |
| 78.352543 | -10.047 |
| 78.373371 | -10.212 |
| 78.393454 | -10.362 |
| 78.419948 | -10.391 |
| 78.432609 | -10.317 |
| 78.452528 | -10.111 |
| 78.473483 | -9.831 |
| 78.501667 | -9.401 |
| 78.513739 | -9.346 |
| 78.532513 | -9.234 |
| 78.552632 | -9.282 |
| 78.58389 | -9.506 |
| 78.593604 | -9.617 |
| 78.613484 | -9.935 |
| 78.632539 | -9.989 |
| 78.662019 | -9.935 |
| 78.673475 | -9.99 |
| 78.694231 | -9.953 |
| 78.714321 | -9.842 |
| 78.757145 | -9.914 |
| 78.774509 | -9.923 |
| 78.793609 | -9.999 |
| 78.814698 | -10.072 |
| 78.832688 | -9.896 |
| 78.853176 | -9.841 |
| 78.873379 | -9.897 |
| 78.89668 | -9.962 |
| 78.914028 | -10.101 |
| 78.932815 | -10.129 |
| 78.952503 | -10.027 |
| 78.975554 | -9.914 |
| 78.995632 | -9.792 |
| 79.013462 | -9.663 |
| 79.032564 | -9.672 |
| 79.056049 | -9.546 |
| 79.073093 | -9.408 |
| 79.09526 | -9.341 |
| 79.113931 | -9.412 |
| 79.136204 | -9.479 |
| 79.152921 | -9.657 |
| 79.173366 | -9.909 |
| 79.195148 | -10.282 |
| 79.217709 | -10.376 |
| 79.23263 | -10.432 |
| 79.25252 | -10.338 |
| 79.273362 | -10.179 |
| 79.29597 | -9.747 |
| 79.313694 | -9.746 |
| 79.332548 | -9.69 |
| 79.352508 | -9.746 |
| 79.37923 | -9.643 |
| 79.393405 | -9.615 |
| 79.41301 | -9.586 |
| 79.432536 | -9.548 |
| 79.459128 | -9.681 |
| 79.473438 | -9.756 |
| 79.493407 | -9.804 |
| 79.513128 | -9.897 |
| 79.539531 | -10.036 |
| 79.552425 | -10.056 |
| 79.572654 | -9.991 |
| 79.593507 | -9.805 |
| 79.620294 | -9.72 |
| 79.633355 | -9.775 |
| 79.652524 | -9.748 |
| 79.67337 | -9.759 |
| 79.702618 | -9.656 |
| 79.713756 | -9.711 |
| 79.732638 | -9.664 |
| 79.752524 | -9.618 |
| 79.799254 | -9.822 |
| 79.813936 | -9.803 |
| 79.83253 | -9.877 |
| 79.854356 | -9.832 |
| 79.873448 | -10.001 |
| 79.895383 | -10.047 |
| 79.91346 | -9.952 |
| 79.935392 | -9.924 |
| 79.952659 | -9.869 |
| 79.97336 | -9.861 |
| 79.995243 | -9.795 |
| 80.017207 | -9.803 |
| 80.032837 | -9.776 |
| 80.052514 | -9.776 |
| 80.073362 | -9.849 |
| 80.098277 | -9.7 |
| 80.113928 | -9.625 |
| 80.132502 | -9.336 |
| 80.15253 | -9.103 |
| 80.177862 | -9.023 |
| 80.195891 | -9.079 |
| 80.213466 | -8.938 |
| 80.232544 | -9.003 |
| 80.25536 | -9.108 |
| 80.273358 | -9.162 |
| 80.295497 | -9.423 |
| 80.313587 | -9.59 |
| 80.336712 | -9.59 |
| 80.352551 | -9.646 |
| 80.373343 | -9.645 |
| 80.39518 | -9.403 |
| 80.421475 | -9.283 |
| 80.432656 | -9.282 |
| 80.452541 | -9.31 |
| 80.473384 | -9.412 |
| 80.499936 | -9.598 |
| 80.513475 | -9.636 |
| 80.532663 | -9.796 |
| 80.552511 | -9.684 |
| 80.580055 | -9.99 |
| 80.59354 | -10.045 |
| 80.613551 | -10.054 |
| 80.63259 | -10.084 |
| 80.66019 | -9.898 |
| 80.672835 | -9.597 |
| 80.693382 | -9.522 |
| 80.713832 | -9.123 |
| 80.738701 | -8.976 |
| 80.75258 | -9.069 |
| 80.772763 | -9.361 |
| 80.794015 | -9.752 |
| 80.820233 | -10.178 |
| 80.833402 | -10.252 |
| 80.852523 | -10.288 |
| 80.873402 | -10.063 |
| 80.922603 | -9.097 |
| 80.933015 | -9.068 |
| 80.95263 | -8.965 |
| 80.975076 | -9.088 |
| 80.99369 | -9.369 |
| 81.01358 | -9.677 |
| 81.032524 | -9.806 |
| 81.057184 | -10.203 |
| 81.073565 | -10.277 |
| 81.093384 | -10.233 |
| 81.113604 | -9.971 |
| 81.137179 | -9.774 |
| 81.152733 | -9.579 |
| 81.173425 | -9.271 |
| 81.193716 | -9.124 |
| 81.217464 | -9.183 |
| 81.233486 | -9.351 |
| 81.252523 | -9.527 |
| 81.27347 | -9.73 |
| 81.298991 | -9.934 |
| 81.314272 | -9.981 |
| 81.332529 | -9.981 |
| 81.352653 | -9.878 |
| 81.37778 | -9.786 |
| 81.39555 | -9.572 |
| 81.413499 | -9.367 |
| 81.432646 | -9.171 |
| 81.458241 | -9.013 |
| 81.473417 | -9.097 |
| 81.495601 | -9.256 |
| 81.513511 | -9.422 |
| 81.538034 | -9.59 |
| 81.552868 | -9.693 |
| 81.573439 | -10.038 |
| 81.595888 | -10.28 |
| 81.621348 | -10.429 |
| 81.632678 | -10.457 |
| 81.652513 | -10.26 |
| 81.673372 | -10.064 |
| 81.701279 | -9.568 |
| 81.714503 | -9.4 |
| 81.732511 | -9.169 |
| 81.752492 | -9.096 |
| 81.781149 | -9.312 |
| 81.793415 | -9.406 |
| 81.813464 | -9.733 |
| 81.852515 | -9.854 |
| 81.881675 | -10.009 |
| 81.893206 | -10.017 |
| 81.91356 | -10.037 |
| 81.932569 | -9.982 |
| 81.960273 | -9.731 |
| 81.973454 | -9.656 |
| 81.995605 | -9.599 |
| 82.013469 | -9.561 |
| 82.058672 | -9.636 |
| 82.073769 | -9.682 |
| 82.093196 | -9.823 |
| 82.117822 | -9.926 |
| 82.132887 | -10.019 |
| 82.152523 | -10.244 |
| 82.173352 | -10.271 |
| 82.199474 | -10.328 |
| 82.213554 | -10.422 |
| 82.233036 | -10.524 |
| 82.252522 | -10.408 |
| 82.279199 | -9.829 |
| 82.293552 | -9.633 |
| 82.313569 | -9.234 |
| 82.332537 | -9.17 |
| 82.358618 | -9.163 |
| 82.373421 | -9.304 |
| 82.393531 | -9.872 |
| 82.415467 | -10.076 |
| 82.439513 | -10.114 |
| 82.452517 | -10.142 |
| 82.473451 | -10.066 |
| 82.493427 | -10.027 |
| 82.519046 | -9.672 |
| 82.533174 | -9.617 |
| 82.552548 | -9.721 |
| 82.573508 | -9.805 |
| 82.599439 | -9.851 |
| 82.613177 | -9.805 |
| 82.632543 | -9.831 |
| 82.652432 | -9.926 |
| 82.677645 | -9.888 |
| 82.693408 | -9.898 |
| 82.714002 | -10.123 |
| 82.732672 | -10.216 |
| 82.76152 | -10.168 |
| 82.773286 | -10.149 |
| 82.793943 | -10.13 |
| 82.814213 | -10.194 |
| 82.841544 | -10.316 |
| 82.852512 | -10.232 |
| 82.873596 | -9.998 |
| 82.893501 | -9.572 |
| 82.920513 | -9.516 |
| 82.932533 | -9.572 |
| 82.952552 | -9.676 |
| 82.97337 | -9.789 |
| 83.00318 | -9.917 |
| 83.013785 | -9.953 |
| 83.03286 | -9.981 |
| 83.052512 | -9.999 |
| 83.099316 | -9.925 |
| 83.113407 | -9.879 |
| 83.132517 | -9.647 |
| 83.155429 | -9.61 |
| 83.173536 | -9.618 |
| 83.195502 | -9.646 |
| 83.213459 | -9.637 |
| 83.236943 | -9.628 |
| 83.252579 | -9.637 |
| 83.272737 | -9.674 |
| 83.29558 | -9.768 |
| 83.318833 | -10 |
| 83.333252 | -9.982 |
| 83.352505 | -10.131 |
| 83.373366 | -10.121 |
| 83.39843 | -9.936 |
| 83.413401 | -9.936 |
| 83.432511 | -9.795 |
| 83.452497 | -9.654 |
| 83.478697 | -9.433 |
| 83.493416 | -9.423 |
| 83.51346 | -9.48 |
| 83.532565 | -9.592 |
| 83.560229 | -9.767 |
| 83.573446 | -9.888 |
| 83.593505 | -10.008 |
| 83.613732 | -10.092 |
| 83.638184 | -9.99 |
| 83.652459 | -9.888 |
| 83.673381 | -9.796 |
| 83.693592 | -9.73 |
| 83.717473 | -9.683 |
| 83.732596 | -9.628 |
| 83.752515 | -9.573 |
| 83.773374 | -9.516 |
| 83.800614 | -9.655 |
| 83.813808 | -9.721 |
| 83.832517 | -9.805 |
| 83.852522 | -9.898 |
| 83.880295 | -10.111 |
| 83.89341 | -10.185 |
| 83.913611 | -10.232 |
| 83.932528 | -10.204 |
| 83.961074 | -10.149 |
| 83.9735 | -10.085 |
| 83.993435 | -10.056 |
| 84.013549 | -9.945 |
| 84.03865 | -9.431 |
| 84.052594 | -9.44 |
| 84.07337 | -9.469 |
| 84.093428 | -9.543 |
| 84.120037 | -9.608 |
| 84.132544 | -9.786 |
| 84.152502 | -10.01 |
| 84.173446 | -10.158 |
| 84.220928 | -10.26 |
| 84.232454 | -10.149 |
| 84.252532 | -9.973 |
| 84.275923 | -9.852 |
| 84.293504 | -9.758 |
| 84.313523 | -9.701 |
| 84.332517 | -9.589 |
| 84.356764 | -9.523 |
| 84.373454 | -9.459 |
| 84.393491 | -9.497 |
| 84.4148 | -9.768 |
| 84.437793 | -10.058 |
| 84.452551 | -10.187 |
| 84.47338 | -10.215 |
| 84.493709 | -10.196 |
| 84.518741 | -10.233 |
| 84.532634 | -10.083 |
| 84.552509 | -9.943 |
| 84.573466 | -10.008 |
| 84.598834 | -9.84 |
| 84.613907 | -9.664 |
| 84.632614 | -9.571 |
| 84.652673 | -9.506 |
| 84.67938 | -9.582 |
| 84.69356 | -9.657 |
| 84.713458 | -9.786 |
| 84.733087 | -9.917 |
| 84.757041 | -10.028 |
| 84.773638 | -10.075 |
| 84.793496 | -10.075 |
| 84.813452 | -9.981 |
| 84.83933 | -9.897 |
| 84.852519 | -9.851 |
| 84.873356 | -9.777 |
| 84.893507 | -9.693 |
| 84.919609 | -9.57 |
| 84.932604 | -9.579 |
| 84.952588 | -9.62 |
| 84.973366 | -10 |
| 85.00255 | -9.954 |
| 85.013505 | -9.934 |
| 85.032631 | -9.907 |
| 85.052508 | -10.036 |
| 85.082562 | -10.017 |
| 85.093444 | -9.98 |
| 85.113457 | -10.075 |
| 85.132528 | -10.019 |
| 85.162234 | -10.055 |
| 85.173563 | -10.028 |
| 85.195135 | -10.018 |
| 85.21355 | -9.926 |
| 85.242181 | -9.609 |
| 85.252635 | -9.562 |
| 85.27353 | -9.506 |
| 85.29726 | -9.609 |
| 85.341324 | -9.954 |
| 85.353202 | -10.019 |
| 85.373322 | -10.186 |
| 85.398682 | -10.074 |
| 85.413499 | -9.935 |
| 85.432641 | -9.963 |
| 85.452508 | -9.87 |
| 85.476882 | -9.945 |
| 85.495283 | -9.795 |
| 85.513472 | -9.737 |
| 85.53241 | -9.646 |
| 85.554947 | -9.545 |
| 85.573489 | -9.405 |
| 85.59532 | -10.134 |
| 85.613486 | -10.895 |
| 85.636385 | -12.388 |
| 85.652516 | -13.089 |
| 85.673651 | -10.824 |
| 85.696074 | -10.681 |
| 85.720323 | -10.642 |
| 85.733886 | -10.569 |
| 85.75268 | -10.347 |
| 85.773413 | -10.439 |
| 85.801045 | -10.001 |
| 85.813469 | -9.746 |
| 85.83258 | -9.378 |
| 85.852648 | -9.156 |
| 85.879985 | -9.126 |
| 85.893997 | -9.091 |
| 85.913674 | -9.383 |
| 85.932619 | -9.659 |
| 85.960118 | -9.924 |
| 85.973934 | -9.99 |
| 85.994034 | -10.048 |
| 86.014022 | -10.01 |
| 86.038896 | -9.952 |
| 86.05321 | -9.97 |
| 86.073412 | -9.95 |
| 86.093323 | -9.766 |
| 86.119839 | -9.666 |
| 86.132463 | -9.664 |
| 86.152586 | -9.653 |
| 86.173437 | -9.655 |
| 86.202564 | -9.951 |
| 86.21346 | -9.989 |
| 86.232648 | -9.963 |
| 86.25249 | -9.869 |
| 86.282366 | -9.758 |
| 86.293653 | -9.823 |
| 86.313538 | -9.824 |
| 86.332522 | -9.804 |
| 86.362718 | -9.692 |
| 86.373449 | -9.618 |
| 86.394985 | -9.496 |
| 86.413446 | -9.375 |
| 86.459923 | -9.719 |
| 86.474104 | -9.812 |
| 86.495843 | -10.008 |
| 86.518865 | -10.047 |
| 86.532786 | -10.038 |
| 86.552571 | -10.01 |
| 86.573405 | -10.029 |
| 86.600482 | -9.86 |
| 86.613704 | -9.747 |
| 86.6325 | -9.71 |
| 86.652507 | -9.533 |
| 86.679838 | -9.394 |
| 86.693571 | -9.384 |
| 86.713411 | -9.562 |
| 86.732564 | -9.413 |
| 86.757755 | -9.599 |
| 86.773401 | -9.748 |
| 86.793499 | -9.889 |
| 86.813448 | -10.019 |
| 86.840032 | -9.992 |
| 86.852577 | -9.973 |
| 86.873422 | -9.916 |
| 86.893599 | -9.721 |
| 86.919983 | -9.644 |
| 86.932438 | -9.513 |
| 86.952505 | -8.809 |
| 86.973284 | -9.043 |
| 87.000962 | -7.82 |
| 87.01355 | -7.095 |
| 87.032629 | -6.799 |
| 87.052823 | -6.772 |
| 87.083303 | -8.019 |
| 87.093576 | -8.488 |
| 87.113532 | -8.946 |
| 87.132558 | -9.945 |
| 87.162836 | -10.64 |
| 87.173451 | -10.815 |
| 87.193857 | -10.632 |
| 87.21436 | -10.896 |
| 87.241422 | -10.805 |
| 87.252538 | -10.6 |
| 87.2735 | -10.376 |
| 87.29349 | -10.022 |
| 87.321218 | -9.67 |
| 87.332396 | -9.698 |
| 87.3527 | -9.721 |
| 87.373364 | -9.796 |
| 87.403496 | -9.842 |
| 87.413977 | -9.878 |
| 87.43254 | -9.868 |
| 87.452509 | -9.861 |
| 87.501107 | -9.924 |
| 87.513476 | -9.896 |
| 87.532512 | -9.914 |
| 87.555729 | -9.888 |
| 87.57339 | -9.851 |
| 87.595485 | -9.86 |
| 87.613461 | -9.943 |
| 87.636557 | -9.896 |
| 87.652413 | -9.914 |
| 87.673337 | -9.83 |
| 87.695024 | -9.785 |
| 87.718479 | -9.814 |
| 87.732888 | -9.822 |
| 87.752508 | -9.823 |
| 87.773342 | -9.74 |
| 87.800962 | -10 |
| 87.813443 | -10.121 |
| 87.832519 | -10.185 |
| 87.852469 | -10.176 |
| 87.879576 | -10.11 |
| 87.893547 | -9.981 |
| 87.913446 | -9.841 |
| 87.932521 | -9.71 |
| 87.959755 | -9.692 |
| 87.973421 | -9.729 |
| 87.993013 | -9.804 |
| 88.012764 | -9.804 |
| 88.038366 | -9.795 |
| 88.052621 | -9.804 |
| 88.073354 | -9.832 |
| 88.094123 | -9.897 |
| 88.121175 | -9.917 |
| 88.132522 | -9.907 |
| 88.1525 | -9.851 |
| 88.173539 | -9.766 |
| 88.202988 | -9.767 |
| 88.213554 | -9.814 |
| 88.232536 | -9.776 |
| 88.252578 | -9.86 |
| 88.280904 | -9.879 |
| 88.293494 | -9.907 |
| 88.313674 | -9.964 |
| 88.332577 | -10.037 |
| 88.363139 | -10.008 |
| 88.373446 | -9.942 |
| 88.395284 | -9.711 |
| 88.413507 | -9.656 |
| 88.441642 | -9.599 |
| 88.452503 | -9.673 |
| 88.47344 | -9.74 |
| 88.495627 | -9.778 |
| 88.523257 | -9.924 |
| 88.532609 | -9.933 |
| 88.552546 | -9.998 |
| 88.573448 | -10 |
| 88.620447 | -10.157 |
| 88.632464 | -10.083 |
| 88.652493 | -9.99 |
| 88.674749 | -9.795 |
| 88.693952 | -9.851 |
| 88.712545 | -9.935 |
| 88.732513 | -9.972 |
| 88.757745 | -9.87 |
| 88.773512 | -9.786 |
| 88.793536 | -9.822 |
| 88.813067 | -9.812 |
| 88.836963 | -9.786 |
| 88.852517 | -9.805 |
| 88.873373 | -9.945 |
| 88.893557 | -10.01 |
| 88.918541 | -10.045 |
| 88.932979 | -10.017 |
| 88.952501 | -9.943 |
| 88.973343 | -9.887 |
| 89.000196 | -9.953 |
| 89.013817 | -9.943 |
| 89.032548 | -9.748 |
| 89.052537 | -9.701 |
| 89.079813 | -9.767 |
| 89.093891 | -9.777 |
| 89.113484 | -9.926 |
| 89.13254 | -10.095 |
| 89.159923 | -10.288 |
| 89.173403 | -10.259 |
| 89.19347 | -10.036 |
| 89.214658 | -9.852 |
| 89.240328 | -9.702 |
| 89.25248 | -9.683 |
| 89.273455 | -9.702 |
| 89.293486 | -9.749 |
| 89.320006 | -10.27 |
| 89.33262 | -10.356 |
| 89.352597 | -10.589 |
| 89.373354 | -10.522 |
| 89.401798 | -10.129 |
| 89.413654 | -9.85 |
| 89.432377 | -9.542 |
| 89.452499 | -9.356 |
| 89.481994 | -9.545 |
| 89.493532 | -9.675 |
| 89.513448 | -10.028 |
| 89.532585 | -10.375 |
| 89.561811 | -10.924 |
| 89.573433 | -10.913 |
| 89.595241 | -10.77 |
| 89.613552 | -10.351 |
| 89.641436 | -9.698 |
| 89.652594 | -9.597 |
| 89.673334 | -9.322 |
| 89.695176 | -9.448 |
| 89.739905 | -11.389 |
| 89.752662 | -11.993 |
| 89.773348 | -12.343 |
| 89.798227 | -10.573 |
| 89.813457 | -9.87 |
| 89.832676 | -8.96 |
| 89.852496 | -8.865 |
| 89.878304 | -9.178 |
| 89.895445 | -9.497 |
| 89.913537 | -9.645 |
| 89.932557 | -9.534 |
| 89.956401 | -9.691 |
| 89.973416 | -9.734 |
| 89.995265 | -9.716 |
| 90.013457 | -9.415 |
| 90.03595 | -9.255 |
| 90.052467 | -9.339 |
| 90.073334 | -9.409 |
| 90.097593 | -9.67 |
| 90.120498 | -10.151 |
| 90.132665 | -10.262 |
| 90.152505 | -10.309 |
| 90.172738 | -10.29 |
| 90.19988 | -9.91 |
| 90.213615 | -9.811 |
| 90.233128 | -9.635 |
| 90.252759 | -9.618 |
| 90.2799 | -9.678 |
| 90.293525 | -9.814 |
| 90.313486 | -9.805 |
| 90.333486 | -9.76 |
| 90.359372 | -9.679 |
| 90.373382 | -9.624 |
| 90.39406 | -9.709 |
| 90.415138 | -9.777 |
| 90.439726 | -9.883 |
| 90.452605 | -9.864 |
| 90.473393 | -9.693 |
| 90.493554 | -9.58 |
| 90.519779 | -9.544 |
| 90.532901 | -9.515 |
| 90.552503 | -9.485 |
| 90.573332 | -9.551 |
| 90.600535 | -9.635 |
| 90.614469 | -9.793 |
| 90.632656 | -9.952 |
| 90.653233 | -10.118 |
| 90.683584 | -10.231 |
| 90.713639 | -10.1 |
| 90.732446 | -10.054 |
| 90.759031 | -9.794 |
| 90.773879 | -9.69 |
| 90.793663 | -9.598 |
| 90.813442 | -9.709 |
| 90.857668 | -9.663 |
| 90.873593 | -9.71 |
| 90.893488 | -9.813 |
| 90.914689 | -9.747 |
| 90.933273 | -9.878 |
| 90.952591 | -9.747 |
| 90.972566 | -10.037 |
| 90.997214 | -10.288 |
| 91.013703 | -10.325 |
| 91.032508 | -9.926 |
| 91.052494 | -9.561 |
| 91.077263 | -9.498 |
| 91.095345 | -9.576 |
| 91.113439 | -9.481 |
| 91.132492 | -9.466 |
| 91.155686 | -9.5 |
| 91.173376 | -9.37 |
| 91.195077 | -9.263 |
| 91.213343 | -9.312 |
| 91.236536 | -9.428 |
| 91.252504 | -9.593 |
| 91.27335 | -9.738 |
| 91.29768 | -9.963 |
| 91.319533 | -10.317 |
| 91.333115 | -10.27 |
| 91.352513 | -10.147 |
| 91.373246 | -10.096 |
| 91.399356 | -9.806 |
| 91.413471 | -9.766 |
| 91.432756 | -9.671 |
| 91.452529 | -9.421 |
| 91.480695 | -9.311 |
| 91.493361 | -9.331 |
| 91.513443 | -9.348 |
| 91.532505 | -9.439 |
| 91.558108 | -9.718 |
| 91.573392 | -9.755 |
| 91.593476 | -9.857 |
| 91.612773 | -9.905 |
| 91.638624 | -9.98 |
| 91.652498 | -10.082 |
| 91.673584 | -10.072 |
| 91.693356 | -9.915 |
| 91.719056 | -9.666 |
| 91.732712 | -9.663 |
| 91.752474 | -9.493 |
| 91.773352 | -9.597 |
| 91.800794 | -9.809 |
| 91.813941 | -9.948 |
| 91.832504 | -9.958 |
| 91.852492 | -9.83 |
| 91.900312 | -10.055 |
| 91.913464 | -10.103 |
| 91.932504 | -10.16 |
| 91.953954 | -10.18 |
| 91.97354 | -9.92 |
| 91.995381 | -9.836 |
| 92.013251 | -9.557 |
| 92.033042 | -9.359 |
| 92.052397 | -9.199 |
| 92.073331 | -9.057 |
| 92.097768 | -9.092 |
| 92.11858 | -9.196 |
| 92.133188 | -9.178 |
| 92.152495 | -9.551 |
| 92.173333 | -10.03 |
| 92.197545 | -10.337 |
| 92.213568 | -10.272 |
| 92.232526 | -10.129 |
| 92.252492 | -9.606 |
| 92.276951 | -9.132 |
| 92.294792 | -8.788 |
| 92.313433 | -8.827 |
| 92.332505 | -8.724 |
| 92.355692 | -8.625 |
| 92.37336 | -9.202 |
| 92.39523 | -9.573 |
| 92.413436 | -9.636 |
| 92.437205 | -9.446 |
| 92.452621 | -9.305 |
| 92.473514 | -9.151 |
| 92.495408 | -9.285 |
| 92.521445 | -9.289 |
| 92.532752 | -9.231 |
| 92.552483 | -9.599 |
| 92.573343 | -9.833 |
| 92.599494 | -9.739 |
| 92.613795 | -9.814 |
| 92.632497 | -10.126 |
| 92.652492 | -10.964 |
| 92.679434 | -10.791 |
| 92.693424 | -10.847 |
| 92.71353 | -10.618 |
| 92.732718 | -10.595 |
| 92.759026 | -11.008 |
| 92.773404 | -10.996 |
| 92.79408 | -11.04 |
| 92.813542 | -10.831 |
| 92.839419 | -10.677 |
| 92.852623 | -10.725 |
| 92.873371 | -10.284 |
| 92.894049 | -10.045 |
| 92.920774 | -10.083 |
| 92.932573 | -10.034 |
| 92.952622 | -9.557 |
| 92.973365 | -9.283 |
| 93.022262 | -8.429 |
| 93.032621 | -8.342 |
| 93.052596 | -8.003 |
| 93.075841 | -8.07 |
| 93.093943 | -8.621 |
| 93.113436 | -8.987 |
| 93.132544 | -9.477 |
| 93.157677 | -9.698 |
| 93.173379 | -9.932 |
| 93.19356 | -10.04 |
| 93.213525 | -9.72 |
| 93.237151 | -9.398 |
| 93.252423 | -9.387 |
| 93.273356 | -9.384 |
| 93.293431 | -10.706 |
| 93.317822 | -9.864 |
| 93.332862 | -10.087 |
| 93.352495 | -10.402 |
| 93.373333 | -10.477 |
| 93.400243 | -10.706 |
| 93.413478 | -10.491 |
| 93.43268 | -10.104 |
| 93.452495 | -10.01 |
| 93.480034 | -9.872 |
| 93.493424 | -9.835 |
| 93.51345 | -9.539 |
| 93.532535 | -9.341 |
| 93.562848 | -9.582 |
| 93.573436 | -9.641 |
| 93.595072 | -9.794 |
| 93.613417 | -9.853 |
| 93.639547 | -9.805 |
| 93.652524 | -9.832 |
| 93.673349 | -9.829 |
| 93.69259 | -9.814 |
| 93.720944 | -9.487 |
| 93.732627 | -9.346 |
| 93.752486 | -9.374 |
| 93.773285 | -9.321 |
| 93.802589 | -9.201 |
| 93.813865 | -9.144 |
| 93.832486 | -9.17 |
| 93.853017 | -9.215 |
| 93.882246 | -9.165 |
| 93.893509 | -9.26 |
| 93.91266 | -9.279 |
| 93.932585 | -9.34 |
| 93.963206 | -9.365 |
| 93.973447 | -9.393 |
| 93.99554 | -9.425 |
| 94.013439 | -9.585 |
| 94.041847 | -9.674 |
| 94.052496 | -9.59 |
| 94.073332 | -9.433 |
| 94.097817 | -9.65 |
| 94.142218 | -9.853 |
| 94.153051 | -9.918 |
| 94.173336 | -10.059 |
| 94.198858 | -10.156 |
| 94.213079 | -10.148 |
| 94.232705 | -10.102 |
| 94.252486 | -10.099 |
| 94.278429 | -10.134 |
| 94.293462 | -10.217 |
| 94.313462 | -10.182 |
| 94.332522 | -10.015 |
| 94.358817 | -9.995 |
| 94.373634 | -10.013 |
| 94.393612 | -9.949 |
| 94.41482 | -9.895 |
| 94.438834 | -9.777 |
| 94.452413 | -9.88 |
| 94.473355 | -9.804 |
| 94.493403 | -9.59 |
| 94.519149 | -9.629 |
| 94.532634 | -9.684 |
| 94.552677 | -9.861 |
| 94.573251 | -9.833 |
| 94.60056 | -9.773 |
| 94.613769 | -9.801 |
| 94.632482 | -9.907 |
| 94.652698 | -9.89 |
| 94.681067 | -9.55 |
| 94.693411 | -9.492 |
| 94.713437 | -9.402 |
| 94.732613 | -9.29 |
| 94.76005 | -9.08 |
| 94.773414 | -8.92 |
| 94.793414 | -9.069 |
| 94.813359 | -9.186 |
| 94.84024 | -9.395 |
| 94.852535 | -9.647 |
| 94.873371 | -10.299 |
| 94.89347 | -11.084 |
| 94.91992 | -12.086 |
| 94.932539 | -12.325 |
| 94.952465 | -12.777 |
| 94.973345 | -12.719 |
| 95.002964 | -11.857 |
| 95.013684 | -11.497 |
| 95.032721 | -10.72 |
| 95.052486 | -9.953 |
| 95.082213 | -9.365 |
| 95.093411 | -9.014 |
| 95.113437 | -8.818 |
| 95.132496 | -9.119 |
| 95.162565 | -9.292 |
| 95.173639 | -9.369 |
| 95.195691 | -8.827 |
| 95.213431 | -8.433 |
| 95.25976 | -8.868 |
| 95.273475 | -8.832 |
| 95.295371 | -8.654 |
| 95.318518 | -8.706 |
| 95.334362 | -8.777 |
| 95.352473 | -9.216 |
| 95.373314 | -9.452 |
| 95.400185 | -9.898 |
| 95.413377 | -10.041 |
| 95.433059 | -9.578 |
| 95.452476 | -9.274 |
| 95.478772 | -9.746 |
| 95.493424 | -9.969 |
| 95.513483 | -9.508 |
| 95.532592 | -9.597 |
| 95.558647 | -9.801 |
| 95.573392 | -10.622 |
| 95.593364 | -11.265 |
| 95.613484 | -11.407 |
| 95.639849 | -11.512 |
| 95.652609 | -11.428 |
| 95.673348 | -10.324 |
| 95.693782 | -10.115 |
| 95.720121 | -10.335 |
| 95.732764 | -10.126 |
| 95.752484 | -9.884 |
| 95.773639 | -9.641 |
| 95.801098 | -8.961 |
| 95.814274 | -9.243 |
| 95.832477 | -9.601 |
| 95.852851 | -9.423 |
| 95.880129 | -9.084 |
| 95.893567 | -9.13 |
| 95.913508 | -9.584 |
| 95.93261 | -10.066 |
| 95.962014 | -10.021 |
| 95.973425 | -10.187 |
| 95.996022 | -9.954 |
| 96.013437 | -9.906 |
| 96.041484 | -9.808 |
| 96.05254 | -9.919 |
| 96.07366 | -9.712 |
| 96.095991 | -9.692 |
| 96.123368 | -9.814 |
| 96.132605 | -9.902 |
| 96.152473 | -10.09 |
| 96.173458 | -9.919 |
| 96.204164 | -9.421 |
| 96.215132 | -9.344 |
| 96.232674 | -9.405 |
| 96.252527 | -9.931 |
| 96.30088 | -11.027 |
| 96.313474 | -11.148 |
| 96.332716 | -10.888 |
| 96.356929 | -10.368 |
| 96.373418 | -10.248 |
| 96.395868 | -9.977 |
| 96.413448 | -9.934 |
| 96.438197 | -9.548 |
| 96.452748 | -9.255 |
| 96.473538 | -8.772 |
| 96.495603 | -10.809 |
| 96.520399 | -11.875 |
| 96.532572 | -12.27 |
| 96.553501 | -12.714 |
| 96.573354 | -12.624 |
| 96.601541 | -14.05 |
| 96.613438 | -14.019 |
| 96.632576 | -14.232 |
| 96.652539 | -13.228 |
| 96.680726 | -12.126 |
| 96.694189 | -11.708 |
| 96.713467 | -10.965 |
| 96.732748 | -9.928 |
| 96.760133 | -8.399 |
| 96.773343 | -8.005 |
| 96.79392 | -7.513 |
| 96.812902 | -7.215 |
| 96.839643 | -6.722 |
| 96.85263 | -6.57 |
| 96.873506 | -6.732 |
| 96.894116 | -6.739 |
| 96.920467 | -10.991 |
| 96.932438 | -9.445 |
| 96.95252 | -8.45 |
| 96.973423 | -6.188 |
| 97.003812 | -6.672 |
| 97.013941 | -7.371 |
| 97.032456 | -8.139 |
| 97.052507 | -8.379 |
| 97.084332 | -7.922 |
| 97.093438 | -7.594 |
| 97.113517 | -7.292 |
| 97.13249 | -7.233 |
| 97.163757 | -7.341 |
| 97.173516 | -7.275 |
| 97.195351 | -7.383 |
| 97.213425 | -7.908 |
| 97.243447 | -8.666 |
| 97.252504 | -8.818 |
| 97.273418 | -9.162 |
| 97.293547 | -9.237 |
| 97.323818 | -9.545 |
| 97.332574 | -9.613 |
| 97.352483 | -9.914 |
| 97.373326 | -9.949 |
| 97.423534 | -10.242 |
| 97.432479 | -10.362 |
| 97.452483 | -10.288 |
| 97.479948 | -10.052 |
| 97.49344 | -10.144 |
| 97.513438 | -10.319 |
| 97.53249 | -10.291 |
| 97.558928 | -10.2 |
| 97.573386 | -10.081 |
| 97.593479 | -9.95 |
| 97.613513 | -9.791 |
| 97.639585 | -9.632 |
| 97.652464 | -9.668 |
| 97.673329 | -9.798 |
| 97.693361 | -9.745 |
| 97.719112 | -9.838 |
| 97.732954 | -9.94 |
| 97.752502 | -9.987 |
| 97.773341 | -9.922 |
| 97.801677 | -9.972 |
| 97.812735 | -9.908 |
| 97.83252 | -9.951 |
| 97.85248 | -9.825 |
| 97.881688 | -9.489 |
| 97.893622 | -9.323 |
| 97.913437 | -9.256 |
| 97.93264 | -9.431 |
| 97.962451 | -9.381 |
| 97.973414 | -9.082 |
| 97.99272 | -9.077 |
| 98.013448 | -9.19 |
| 98.041784 | -9.585 |
| 98.052603 | -9.639 |
| 98.073289 | -9.571 |
| 98.095598 | -9.703 |
| 98.123304 | -9.795 |
| 98.132747 | -9.785 |
| 98.152514 | -9.853 |
| 98.173379 | -9.779 |
| 98.203779 | -9.639 |
| 98.214251 | -9.63 |
| 98.232979 | -9.482 |
| 98.252538 | -9.538 |
| 98.284394 | -9.41 |
| 98.293437 | -9.457 |
| 98.313427 | -9.449 |
| 98.332557 | -9.431 |
| 98.363605 | -9.68 |
| 98.373336 | -9.652 |
| 98.395477 | -9.591 |
| 98.413423 | -9.647 |
| 98.444165 | -9.654 |
| 98.473548 | -9.849 |
| 98.493492 | -9.951 |
| 98.540968 | -9.916 |
| 98.553864 | -10.017 |
| 98.573314 | -10.054 |
| 98.601149 | -10.007 |
| 98.613422 | -9.923 |
| 98.632438 | -9.895 |
| 98.652514 | -9.933 |
| 98.680591 | -9.923 |
| 98.69353 | -9.857 |
| 98.713481 | -9.708 |
| 98.732685 | -9.539 |
| 98.759813 | -9.427 |
| 98.773415 | -9.336 |
| 98.793522 | -9.374 |
| 98.813541 | -9.392 |
| 98.840197 | -9.466 |
| 98.852482 | -9.474 |
| 98.873331 | -9.549 |
| 98.893528 | -9.459 |
| 98.919913 | -9.56 |
| 98.932439 | -9.715 |
| 98.952522 | -9.799 |
| 98.973429 | -9.716 |
| 99.002559 | -9.654 |
| 99.013768 | -9.588 |
| 99.032513 | -9.529 |
| 99.052639 | -9.377 |
| 99.082482 | -9.135 |
| 99.093404 | -9.08 |
| 99.113509 | -9.099 |
| 99.132547 | -9.052 |
| 99.164568 | -9.107 |
| 99.173422 | -9.096 |
| 99.195709 | -8.937 |
| 99.213425 | -8.601 |
| 99.24221 | -8.567 |
| 99.252549 | -8.614 |
| 99.273385 | -8.679 |
| 99.297805 | -8.705 |
| 99.325761 | -8.408 |
| 99.33294 | -8.259 |
| 99.352476 | -7.894 |
| 99.373422 | -7.915 |
| 99.404596 | -8.033 |
| 99.413695 | -7.988 |
| 99.432748 | -7.708 |
| 99.452546 | -7.976 |
| 99.484859 | -8.666 |
| 99.493487 | -8.713 |
| 99.513457 | -8.88 |
| 99.532489 | -8.759 |
| 99.564875 | -8.561 |
| 99.573332 | -8.634 |
| 99.594937 | -8.513 |
| 99.613471 | -8.419 |
| 99.660932 | -8.529 |
| 99.673694 | -8.533 |
| 99.695574 | -8.422 |
| 99.719407 | -9.033 |
| 99.732693 | -9.087 |
| 99.75248 | -8.778 |
| 99.773414 | -8.424 |
| 99.801043 | -7.807 |
| 99.813439 | -7.569 |
| 99.832486 | -7.46 |
| 99.852462 | -7.612 |
| 99.878846 | -8.046 |
| 99.893546 | -7.701 |
| 99.913297 | -8.046 |
| 99.932643 | -8.953 |
| 99.958063 | -9.214 |
| 99.973437 | -9.332 |
| 99.993406 | -8.86 |
| 100.013425 | -8.046 |
| 100.039576 | -7.674 |
| 100.05254 | -12.624 |
| 100.073245 | -27.24 |
| 100.09347 | -10.396 |
| 100.142721 | -3.768 |
| 100.152632 | -3.781 |
| 100.17339 | -3.036 |
| 100.202495 | -2.768 |
| 100.213529 | -5.692 |
| 100.233043 | -15.842 |
| 100.252731 | -7.664 |
| 100.2829 | -2.705 |
| 100.293545 | -6.091 |
| 100.313425 | -8.09 |
| 100.332568 | -6.768 |
| 100.362274 | -4.932 |
| 100.373423 | -4.927 |
| 100.39527 | -6.016 |
| 100.413494 | -6.335 |
| 100.443453 | -5.624 |
| 100.452601 | -5.7 |
| 100.47373 | -5.769 |
| 100.493413 | -5.436 |
| 100.52299 | -6.034 |
| 100.532441 | -5.795 |
| 100.552612 | -5.249 |
| 100.573196 | -5.043 |
| 100.605487 | -5.55 |
| 100.614008 | -5.548 |
| 100.632443 | -5.828 |
| 100.652735 | -6.967 |
| 100.699504 | -9.904 |
| 100.7138 | -9.456 |
| 100.732448 | -8.569 |
| 100.756775 | -7.713 |
| 100.773369 | -7.061 |
| 100.795189 | -6.491 |
| 100.813756 | -5.791 |
| 100.837835 | -5.496 |
| 100.852435 | -5.668 |
| 100.873385 | -5.873 |
| 100.895467 | -5.71 |
| 100.920563 | -5.631 |
| 100.932488 | -5.788 |
| 100.952475 | -6.081 |
| 100.97363 | -6.51 |
| 101.000421 | -6.735 |
| 101.013425 | -6.815 |
| 101.032488 | -7.085 |
| 101.052457 | -7.548 |
| 101.080761 | -8.332 |
| 101.093532 | -8.457 |
| 101.113421 | -8.372 |
| 101.132482 | -8.02 |
| 101.161291 | -8.199 |
| 101.173401 | -8.482 |
| 101.192877 | -8.523 |
| 101.213464 | -8.006 |
| 101.239413 | -7.95 |
| 101.252646 | -7.858 |
| 101.273338 | -7.361 |
| 101.293638 | -6.63 |
| 101.322002 | -6.586 |
| 101.352464 | -7.125 |
| 101.373401 | -7.097 |
| 101.402442 | -6.766 |
| 101.413428 | -6.747 |
| 101.432485 | -6.921 |
| 101.452451 | -7.069 |
| 101.480967 | -7.797 |
| 101.493401 | -8.095 |
| 101.513444 | -8.306 |
| 101.53254 | -8.222 |
| 101.562235 | -8.318 |
| 101.573455 | -8.6 |
| 101.595761 | -9.013 |
| 101.613469 | -9.04 |
| 101.642185 | -9.05 |
| 101.652457 | -9.021 |
| 101.673219 | -8.908 |
| 101.695521 | -8.992 |
| 101.723584 | -9.86 |
| 101.732702 | -10.002 |
| 101.752479 | -9.68 |
| 101.773343 | -9.911 |
| 101.822186 | -10.229 |
| 101.832414 | -10.164 |
| 101.852479 | -9.732 |
| 101.875232 | -8.927 |
| 101.893821 | -8.343 |
| 101.913424 | -8.686 |
| 101.932419 | -9.564 |
| 101.956208 | -10.98 |
| 101.973365 | -11.446 |
| 101.993369 | -11.322 |
| 102.013421 | -10.882 |
| 102.038216 | -10.375 |
| 102.052483 | -10.07 |
| 102.073316 | -9.74 |
| 102.093459 | -9.29 |
| 102.118712 | -8.87 |
| 102.132526 | -8.63 |
| 102.152487 | -8.737 |
| 102.173326 | -8.551 |
| 102.200854 | -8.228 |
| 102.213514 | -8.127 |
| 102.232519 | -8.785 |
| 102.252468 | -10.496 |
| 102.279825 | -10.384 |
| 102.294909 | -10.831 |
| 102.313463 | -11.154 |
| 102.332643 | -11.97 |
| 102.360305 | -12.837 |
| 102.373384 | -12.962 |
| 102.393639 | -11.968 |
| 102.414758 | -11.201 |
| 102.440715 | -10.477 |
| 102.452647 | -9.339 |
| 102.473316 | -7.823 |
| 102.493461 | -6.671 |
| 102.519856 | -5.874 |
| 102.53242 | -4.924 |
| 102.552787 | -3.768 |
| 102.573331 | -2.08 |
| 102.602239 | -1.83 |
| 102.613903 | -1.792 |
| 102.632511 | -1.663 |
| 102.652468 | -1.9 |
| 102.681871 | -4.328 |
| 102.693438 | -5.579 |
| 102.713474 | -7.987 |
| 102.732682 | -8.757 |
| 102.762794 | -9.582 |
| 102.773402 | -9.766 |
| 102.795618 | -11.038 |
| 102.813414 | -10.936 |
| 102.843957 | -10.455 |
| 102.852495 | -10.344 |
| 102.873378 | -9.947 |
| 102.893446 | -10.141 |
| 102.940821 | -9.308 |
| 102.952455 | -9.227 |
| 102.973235 | -8.992 |
| 102.998066 | -8.898 |
| 103.012853 | -8.942 |
| 103.032614 | -8.905 |
| 103.052493 | -8.66 |
| 103.080314 | -8.551 |
| 103.093484 | -8.57 |
| 103.112862 | -8.701 |
| 103.132725 | -8.52 |
| 103.159411 | -8.695 |
| 103.173381 | -8.581 |
| 103.193993 | -8.431 |
| 103.213468 | -8.338 |
| 103.240042 | -8.432 |
| 103.252478 | -8.459 |
| 103.273311 | -8.28 |
| 103.293565 | -8.245 |
| 103.320044 | -8.351 |
| 103.332727 | -8.455 |
| 103.35256 | -8.789 |
| 103.373357 | -9.114 |
| 103.402229 | -9.135 |
| 103.413439 | -9.053 |
| 103.432482 | -9.375 |
| 103.452525 | -9.538 |
| 103.48173 | -9.463 |
| 103.493391 | -9.255 |
| 103.513414 | -8.984 |
| 103.532583 | -9.039 |
| 103.564319 | -9.085 |
| 103.573396 | -9.039 |
| 103.595744 | -8.972 |
| 103.61341 | -8.899 |
| 103.64103 | -8.84 |
| 103.652569 | -8.838 |
| 103.673642 | -8.714 |
| 103.695082 | -8.636 |
| 103.722935 | -8.554 |
| 103.732656 | -8.528 |
| 103.752468 | -8.738 |
| 103.773317 | -8.813 |
| 103.804573 | -8.849 |
| 103.813476 | -8.823 |
| 103.832673 | -8.883 |
| 103.852638 | -8.892 |
| 103.883455 | -9.115 |
| 103.893426 | -9.068 |
| 103.913419 | -9.011 |
| 103.93255 | -8.823 |
| 103.961264 | -8.694 |
| 103.973261 | -8.741 |
| 103.995329 | -8.831 |
| 104.013414 | -8.878 |
| 104.058996 | -8.885 |
| 104.073657 | -9.029 |
| 104.093359 | -9.367 |
| 104.118964 | -9.553 |
| 104.132457 | -9.71 |
| 104.152439 | -9.722 |
| 104.173191 | -9.692 |
| 104.198318 | -9.675 |
| 104.214217 | -9.705 |
| 104.232456 | -9.565 |
| 104.252444 | -9.526 |
| 104.279073 | -9.5 |
| 104.293626 | -8.433 |
| 104.313419 | -9.5 |
| 104.332594 | -9.405 |
| 104.359539 | -9.071 |
| 104.373364 | -8.84 |
| 104.3934 | -8.769 |
| 104.414455 | -8.786 |
| 104.438747 | -9.008 |
| 104.452398 | -9.113 |
| 104.47343 | -9.013 |
| 104.493495 | -9.206 |
| 104.52081 | -9.179 |
| 104.532384 | -9.281 |
| 104.552469 | -8.742 |
| 104.573559 | -9.279 |
| 104.601372 | -9.68 |
| 104.613625 | -9.792 |
| 104.6325 | -9.005 |
| 104.652698 | -8.974 |
| 104.681671 | -9.261 |
| 104.69346 | -9.193 |
| 104.713426 | -9.219 |
| 104.732446 | -9.043 |
| 104.760004 | -8.906 |
| 104.773387 | -9.036 |
| 104.793433 | -9.036 |
| 104.813408 | -9.125 |
| 104.841102 | -9.116 |
| 104.85247 | -8.893 |
| 104.873694 | -8.857 |
| 104.893344 | -9.118 |
| 104.920641 | -9.369 |
| 104.93259 | -9.099 |
| 104.952602 | -9.369 |
| 104.973471 | -9.256 |
| 105.002043 | -9.199 |
| 105.012987 | -9.173 |
| 105.032584 | -9.418 |
| 105.052394 | -9.513 |
| 105.096423 | -9.448 |
| 105.113396 | -9.468 |
| 105.132466 | -9.598 |
| 105.155485 | -9.525 |
| 105.173723 | -9.471 |
| 105.19534 | -9.377 |
| 105.213419 | -9.397 |
| 105.235549 | -9.482 |
| 105.252456 | -9.596 |
| 105.272677 | -9.643 |
| 105.295163 | -9.707 |
| 105.31894 | -9.726 |
| 105.332589 | -9.736 |
| 105.352434 | -9.727 |
| 105.373432 | -9.7 |
| 105.4016 | -9.717 |
| 105.413349 | -9.669 |
| 105.432466 | -9.587 |
| 105.452466 | -9.862 |
| 105.479071 | -9.766 |
| 105.493371 | -9.802 |
| 105.513415 | -9.661 |
| 105.532549 | -10.036 |
| 105.573368 | -10.194 |